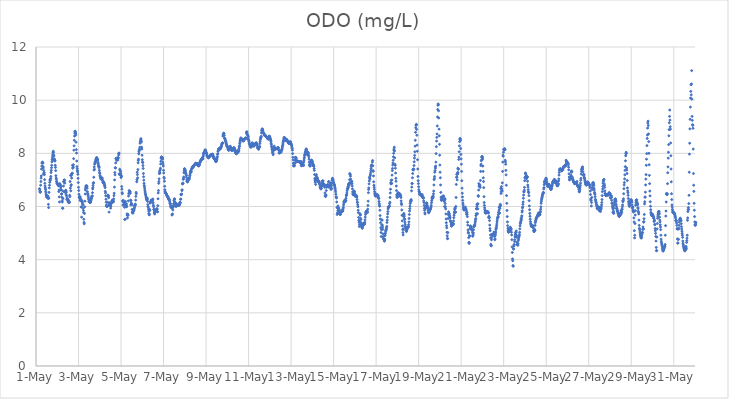
| Category | ODO (mg/L) |
|---|---|
| 44682.166666666664 | 6.67 |
| 44682.177083333336 | 6.63 |
| 44682.1875 | 6.56 |
| 44682.197916666664 | 6.53 |
| 44682.208333333336 | 6.56 |
| 44682.21875 | 6.8 |
| 44682.229166666664 | 6.94 |
| 44682.239583333336 | 7.07 |
| 44682.25 | 7.15 |
| 44682.260416666664 | 7.41 |
| 44682.270833333336 | 7.52 |
| 44682.28125 | 7.63 |
| 44682.291666666664 | 7.65 |
| 44682.302083333336 | 7.67 |
| 44682.3125 | 7.65 |
| 44682.322916666664 | 7.63 |
| 44682.333333333336 | 7.5 |
| 44682.34375 | 7.45 |
| 44682.354166666664 | 7.22 |
| 44682.364583333336 | 7.35 |
| 44682.375 | 7.26 |
| 44682.385416666664 | 7.27 |
| 44682.395833333336 | 7.2 |
| 44682.40625 | 7.01 |
| 44682.416666666664 | 6.87 |
| 44682.427083333336 | 6.77 |
| 44682.4375 | 6.7 |
| 44682.447916666664 | 6.65 |
| 44682.458333333336 | 6.57 |
| 44682.46875 | 6.51 |
| 44682.479166666664 | 6.44 |
| 44682.489583333336 | 6.41 |
| 44682.5 | 6.36 |
| 44682.510416666664 | 6.36 |
| 44682.520833333336 | 6.35 |
| 44682.53125 | 6.39 |
| 44682.541666666664 | 6.39 |
| 44682.552083333336 | 6.38 |
| 44682.5625 | 6.39 |
| 44682.572916666664 | 6.3 |
| 44682.583333333336 | 6.08 |
| 44682.59375 | 5.96 |
| 44682.604166666664 | 6.31 |
| 44682.614583333336 | 6.53 |
| 44682.625 | 6.7 |
| 44682.635416666664 | 6.8 |
| 44682.645833333336 | 6.91 |
| 44682.65625 | 7 |
| 44682.666666666664 | 6.97 |
| 44682.677083333336 | 7.03 |
| 44682.6875 | 7.06 |
| 44682.697916666664 | 7.13 |
| 44682.708333333336 | 7.28 |
| 44682.71875 | 7.36 |
| 44682.729166666664 | 7.46 |
| 44682.739583333336 | 7.55 |
| 44682.75 | 7.68 |
| 44682.760416666664 | 7.76 |
| 44682.770833333336 | 7.83 |
| 44682.78125 | 7.9 |
| 44682.791666666664 | 7.97 |
| 44682.802083333336 | 8.04 |
| 44682.8125 | 8.08 |
| 44682.822916666664 | 8.03 |
| 44682.833333333336 | 7.93 |
| 44682.84375 | 7.9 |
| 44682.854166666664 | 7.75 |
| 44682.864583333336 | 7.79 |
| 44682.875 | 7.75 |
| 44682.885416666664 | 7.71 |
| 44682.895833333336 | 7.72 |
| 44682.90625 | 7.55 |
| 44682.916666666664 | 7.47 |
| 44682.927083333336 | 7.35 |
| 44682.9375 | 7.16 |
| 44682.947916666664 | 7.07 |
| 44682.958333333336 | 7.03 |
| 44682.96875 | 6.95 |
| 44682.979166666664 | 6.92 |
| 44682.989583333336 | 6.86 |
| 44683.0 | 6.86 |
| 44683.010416666664 | 6.86 |
| 44683.020833333336 | 6.84 |
| 44683.03125 | 6.85 |
| 44683.041666666664 | 6.8 |
| 44683.052083333336 | 6.83 |
| 44683.0625 | 6.78 |
| 44683.072916666664 | 6.56 |
| 44683.083333333336 | 6.62 |
| 44683.09375 | 6.36 |
| 44683.104166666664 | 6.17 |
| 44683.114583333336 | 6.86 |
| 44683.125 | 6.82 |
| 44683.135416666664 | 6.78 |
| 44683.145833333336 | 6.81 |
| 44683.15625 | 6.76 |
| 44683.166666666664 | 6.7 |
| 44683.177083333336 | 6.62 |
| 44683.1875 | 6.63 |
| 44683.197916666664 | 6.47 |
| 44683.208333333336 | 6.47 |
| 44683.21875 | 6.35 |
| 44683.229166666664 | 6.22 |
| 44683.239583333336 | 6.17 |
| 44683.25 | 5.94 |
| 44683.260416666664 | 5.93 |
| 44683.270833333336 | 6.3 |
| 44683.28125 | 6.57 |
| 44683.291666666664 | 6.77 |
| 44683.302083333336 | 6.93 |
| 44683.3125 | 6.93 |
| 44683.322916666664 | 7 |
| 44683.333333333336 | 6.99 |
| 44683.34375 | 6.98 |
| 44683.354166666664 | 6.88 |
| 44683.364583333336 | 6.54 |
| 44683.375 | 6.54 |
| 44683.385416666664 | 6.54 |
| 44683.395833333336 | 6.61 |
| 44683.40625 | 6.6 |
| 44683.416666666664 | 6.45 |
| 44683.427083333336 | 6.54 |
| 44683.4375 | 6.4 |
| 44683.447916666664 | 6.26 |
| 44683.458333333336 | 6.32 |
| 44683.46875 | 6.28 |
| 44683.479166666664 | 6.28 |
| 44683.489583333336 | 6.26 |
| 44683.5 | 6.25 |
| 44683.510416666664 | 6.17 |
| 44683.520833333336 | 6.24 |
| 44683.53125 | 6.21 |
| 44683.541666666664 | 6.18 |
| 44683.552083333336 | 6.14 |
| 44683.5625 | 6.15 |
| 44683.572916666664 | 6.17 |
| 44683.583333333336 | 6.42 |
| 44683.59375 | 6.37 |
| 44683.604166666664 | 6.94 |
| 44683.614583333336 | 6.69 |
| 44683.625 | 7.17 |
| 44683.635416666664 | 6.59 |
| 44683.645833333336 | 6.78 |
| 44683.65625 | 6.82 |
| 44683.666666666664 | 7.17 |
| 44683.677083333336 | 7.07 |
| 44683.6875 | 7.24 |
| 44683.697916666664 | 7.24 |
| 44683.708333333336 | 7.25 |
| 44683.71875 | 7.55 |
| 44683.729166666664 | 7.44 |
| 44683.739583333336 | 7.47 |
| 44683.75 | 7.48 |
| 44683.760416666664 | 7.57 |
| 44683.770833333336 | 7.8 |
| 44683.78125 | 8.12 |
| 44683.791666666664 | 8.28 |
| 44683.802083333336 | 8.49 |
| 44683.8125 | 8.65 |
| 44683.822916666664 | 8.76 |
| 44683.833333333336 | 8.83 |
| 44683.84375 | 8.83 |
| 44683.854166666664 | 8.76 |
| 44683.864583333336 | 8.77 |
| 44683.875 | 8.69 |
| 44683.885416666664 | 8.42 |
| 44683.895833333336 | 8.14 |
| 44683.90625 | 8.01 |
| 44683.916666666664 | 7.71 |
| 44683.927083333336 | 7.5 |
| 44683.9375 | 7.42 |
| 44683.947916666664 | 7.35 |
| 44683.958333333336 | 7.3 |
| 44683.96875 | 7.21 |
| 44683.979166666664 | 7.06 |
| 44683.989583333336 | 6.9 |
| 44684.0 | 6.72 |
| 44684.010416666664 | 6.6 |
| 44684.020833333336 | 6.46 |
| 44684.03125 | 6.35 |
| 44684.041666666664 | 6.38 |
| 44684.052083333336 | 6.31 |
| 44684.0625 | 6.33 |
| 44684.072916666664 | 6.23 |
| 44684.083333333336 | 6.36 |
| 44684.09375 | 6.29 |
| 44684.104166666664 | 6.22 |
| 44684.114583333336 | 6.26 |
| 44684.125 | 5.98 |
| 44684.135416666664 | 5.99 |
| 44684.145833333336 | 5.6 |
| 44684.15625 | 6.18 |
| 44684.166666666664 | 6.21 |
| 44684.177083333336 | 6.19 |
| 44684.1875 | 6.12 |
| 44684.197916666664 | 6.09 |
| 44684.208333333336 | 6.07 |
| 44684.21875 | 5.93 |
| 44684.229166666664 | 5.85 |
| 44684.239583333336 | 5.77 |
| 44684.25 | 5.52 |
| 44684.260416666664 | 5.4 |
| 44684.270833333336 | 5.35 |
| 44684.28125 | 5.74 |
| 44684.291666666664 | 5.99 |
| 44684.302083333336 | 6.2 |
| 44684.3125 | 6.47 |
| 44684.322916666664 | 6.62 |
| 44684.333333333336 | 6.69 |
| 44684.34375 | 6.77 |
| 44684.354166666664 | 6.7 |
| 44684.364583333336 | 6.74 |
| 44684.375 | 6.78 |
| 44684.385416666664 | 6.78 |
| 44684.395833333336 | 6.75 |
| 44684.40625 | 6.69 |
| 44684.416666666664 | 6.56 |
| 44684.427083333336 | 6.49 |
| 44684.4375 | 6.48 |
| 44684.447916666664 | 6.43 |
| 44684.458333333336 | 6.39 |
| 44684.46875 | 6.32 |
| 44684.479166666664 | 6.26 |
| 44684.489583333336 | 6.2 |
| 44684.5 | 6.18 |
| 44684.510416666664 | 6.18 |
| 44684.520833333336 | 6.18 |
| 44684.53125 | 6.16 |
| 44684.541666666664 | 6.16 |
| 44684.552083333336 | 6.17 |
| 44684.5625 | 6.15 |
| 44684.572916666664 | 6.2 |
| 44684.583333333336 | 6.23 |
| 44684.59375 | 6.27 |
| 44684.604166666664 | 6.31 |
| 44684.614583333336 | 6.34 |
| 44684.625 | 6.38 |
| 44684.635416666664 | 6.39 |
| 44684.645833333336 | 6.4 |
| 44684.65625 | 6.52 |
| 44684.666666666664 | 6.66 |
| 44684.677083333336 | 6.71 |
| 44684.6875 | 6.79 |
| 44684.697916666664 | 6.87 |
| 44684.708333333336 | 6.9 |
| 44684.71875 | 7.1 |
| 44684.729166666664 | 7.37 |
| 44684.739583333336 | 7.49 |
| 44684.75 | 7.4 |
| 44684.760416666664 | 7.59 |
| 44684.770833333336 | 7.64 |
| 44684.78125 | 7.63 |
| 44684.791666666664 | 7.69 |
| 44684.802083333336 | 7.69 |
| 44684.8125 | 7.76 |
| 44684.822916666664 | 7.73 |
| 44684.833333333336 | 7.8 |
| 44684.84375 | 7.83 |
| 44684.854166666664 | 7.84 |
| 44684.864583333336 | 7.82 |
| 44684.875 | 7.81 |
| 44684.885416666664 | 7.77 |
| 44684.895833333336 | 7.75 |
| 44684.90625 | 7.75 |
| 44684.916666666664 | 7.66 |
| 44684.927083333336 | 7.61 |
| 44684.9375 | 7.55 |
| 44684.947916666664 | 7.51 |
| 44684.958333333336 | 7.5 |
| 44684.96875 | 7.46 |
| 44684.979166666664 | 7.36 |
| 44684.989583333336 | 7.28 |
| 44685.0 | 7.24 |
| 44685.010416666664 | 7.16 |
| 44685.020833333336 | 7.14 |
| 44685.03125 | 7.1 |
| 44685.041666666664 | 7.07 |
| 44685.052083333336 | 7.05 |
| 44685.0625 | 7.03 |
| 44685.072916666664 | 7.07 |
| 44685.083333333336 | 7.08 |
| 44685.09375 | 7.05 |
| 44685.104166666664 | 7.05 |
| 44685.114583333336 | 7.07 |
| 44685.125 | 6.99 |
| 44685.135416666664 | 6.97 |
| 44685.145833333336 | 6.91 |
| 44685.15625 | 6.92 |
| 44685.166666666664 | 6.88 |
| 44685.177083333336 | 6.92 |
| 44685.1875 | 6.9 |
| 44685.197916666664 | 6.89 |
| 44685.208333333336 | 6.86 |
| 44685.21875 | 6.82 |
| 44685.229166666664 | 6.78 |
| 44685.239583333336 | 6.77 |
| 44685.25 | 6.71 |
| 44685.260416666664 | 6.57 |
| 44685.270833333336 | 6.51 |
| 44685.28125 | 6.4 |
| 44685.291666666664 | 6.27 |
| 44685.302083333336 | 6.16 |
| 44685.3125 | 6.05 |
| 44685.322916666664 | 6.02 |
| 44685.333333333336 | 6 |
| 44685.34375 | 6.01 |
| 44685.354166666664 | 6.01 |
| 44685.364583333336 | 6.16 |
| 44685.375 | 6.39 |
| 44685.385416666664 | 6.43 |
| 44685.395833333336 | 6.41 |
| 44685.40625 | 6.39 |
| 44685.416666666664 | 6.33 |
| 44685.427083333336 | 6.04 |
| 44685.4375 | 5.79 |
| 44685.447916666664 | 6.14 |
| 44685.458333333336 | 6.12 |
| 44685.46875 | 6.06 |
| 44685.479166666664 | 6.09 |
| 44685.489583333336 | 6.04 |
| 44685.5 | 6.03 |
| 44685.510416666664 | 5.94 |
| 44685.520833333336 | 6.02 |
| 44685.53125 | 6.13 |
| 44685.541666666664 | 6.13 |
| 44685.552083333336 | 6.12 |
| 44685.5625 | 6.18 |
| 44685.572916666664 | 6.21 |
| 44685.583333333336 | 6.24 |
| 44685.59375 | 6.18 |
| 44685.604166666664 | 6.17 |
| 44685.614583333336 | 6.22 |
| 44685.625 | 6.22 |
| 44685.635416666664 | 6.19 |
| 44685.645833333336 | 6.18 |
| 44685.65625 | 6.29 |
| 44685.666666666664 | 6.41 |
| 44685.677083333336 | 6.5 |
| 44685.6875 | 6.73 |
| 44685.697916666664 | 7 |
| 44685.708333333336 | 7.28 |
| 44685.71875 | 7.19 |
| 44685.729166666664 | 7.46 |
| 44685.739583333336 | 7.45 |
| 44685.75 | 7.64 |
| 44685.760416666664 | 7.8 |
| 44685.770833333336 | 7.79 |
| 44685.78125 | 7.82 |
| 44685.791666666664 | 7.74 |
| 44685.802083333336 | 7.8 |
| 44685.8125 | 7.8 |
| 44685.822916666664 | 7.75 |
| 44685.833333333336 | 7.77 |
| 44685.84375 | 7.82 |
| 44685.854166666664 | 7.75 |
| 44685.864583333336 | 7.84 |
| 44685.875 | 7.83 |
| 44685.885416666664 | 7.94 |
| 44685.895833333336 | 8 |
| 44685.90625 | 8.01 |
| 44685.916666666664 | 7.23 |
| 44685.927083333336 | 7.2 |
| 44685.9375 | 7.4 |
| 44685.947916666664 | 7.21 |
| 44685.958333333336 | 7.36 |
| 44685.96875 | 7.23 |
| 44685.979166666664 | 7.31 |
| 44685.989583333336 | 7.23 |
| 44686.0 | 7.09 |
| 44686.010416666664 | 7.15 |
| 44686.020833333336 | 7.14 |
| 44686.03125 | 6.75 |
| 44686.041666666664 | 6.65 |
| 44686.052083333336 | 6.52 |
| 44686.0625 | 6.48 |
| 44686.072916666664 | 6.21 |
| 44686.083333333336 | 6.21 |
| 44686.09375 | 6.05 |
| 44686.104166666664 | 6.06 |
| 44686.114583333336 | 6.23 |
| 44686.125 | 6.15 |
| 44686.135416666664 | 6.14 |
| 44686.145833333336 | 6.07 |
| 44686.15625 | 6.08 |
| 44686.166666666664 | 5.97 |
| 44686.177083333336 | 5.51 |
| 44686.1875 | 5.52 |
| 44686.197916666664 | 6.12 |
| 44686.208333333336 | 6.19 |
| 44686.21875 | 6.06 |
| 44686.229166666664 | 6.09 |
| 44686.239583333336 | 6.09 |
| 44686.25 | 6.1 |
| 44686.260416666664 | 5.99 |
| 44686.270833333336 | 6.01 |
| 44686.28125 | 5.72 |
| 44686.291666666664 | 5.67 |
| 44686.302083333336 | 5.57 |
| 44686.3125 | 5.68 |
| 44686.322916666664 | 5.71 |
| 44686.333333333336 | 5.67 |
| 44686.34375 | 6.21 |
| 44686.354166666664 | 6.39 |
| 44686.364583333336 | 6.48 |
| 44686.375 | 6.51 |
| 44686.385416666664 | 6.6 |
| 44686.395833333336 | 6.57 |
| 44686.40625 | 6.56 |
| 44686.416666666664 | 6.54 |
| 44686.427083333336 | 6.56 |
| 44686.4375 | 6.5 |
| 44686.447916666664 | 6.24 |
| 44686.458333333336 | 6.06 |
| 44686.46875 | 6.22 |
| 44686.479166666664 | 6.13 |
| 44686.489583333336 | 6.08 |
| 44686.5 | 6.1 |
| 44686.510416666664 | 6.06 |
| 44686.520833333336 | 5.89 |
| 44686.53125 | 5.77 |
| 44686.541666666664 | 5.79 |
| 44686.552083333336 | 5.76 |
| 44686.5625 | 5.75 |
| 44686.572916666664 | 5.81 |
| 44686.583333333336 | 5.84 |
| 44686.59375 | 5.86 |
| 44686.604166666664 | 5.86 |
| 44686.614583333336 | 5.9 |
| 44686.625 | 5.94 |
| 44686.635416666664 | 5.98 |
| 44686.645833333336 | 6.04 |
| 44686.65625 | 6.05 |
| 44686.666666666664 | 6.09 |
| 44686.677083333336 | 6.07 |
| 44686.6875 | 6.24 |
| 44686.697916666664 | 6.38 |
| 44686.708333333336 | 6.53 |
| 44686.71875 | 6.48 |
| 44686.739583333336 | 6.93 |
| 44686.75 | 7.01 |
| 44686.760416666664 | 7.29 |
| 44686.770833333336 | 7.2 |
| 44686.78125 | 7.08 |
| 44686.791666666664 | 7.39 |
| 44686.802083333336 | 7.64 |
| 44686.8125 | 7.73 |
| 44686.822916666664 | 7.78 |
| 44686.833333333336 | 7.98 |
| 44686.84375 | 8.06 |
| 44686.854166666664 | 8.11 |
| 44686.864583333336 | 8.15 |
| 44686.875 | 8.15 |
| 44686.885416666664 | 8.23 |
| 44686.895833333336 | 8.38 |
| 44686.90625 | 8.44 |
| 44686.916666666664 | 8.46 |
| 44686.927083333336 | 8.53 |
| 44686.9375 | 8.55 |
| 44686.947916666664 | 8.47 |
| 44686.958333333336 | 8.43 |
| 44686.96875 | 8.23 |
| 44686.979166666664 | 8.16 |
| 44686.989583333336 | 7.93 |
| 44687.0 | 7.76 |
| 44687.010416666664 | 7.67 |
| 44687.020833333336 | 7.65 |
| 44687.03125 | 7.54 |
| 44687.041666666664 | 7.43 |
| 44687.052083333336 | 7.24 |
| 44687.0625 | 7.12 |
| 44687.072916666664 | 6.99 |
| 44687.083333333336 | 6.87 |
| 44687.09375 | 6.79 |
| 44687.104166666664 | 6.73 |
| 44687.114583333336 | 6.66 |
| 44687.125 | 6.59 |
| 44687.135416666664 | 6.54 |
| 44687.145833333336 | 6.48 |
| 44687.15625 | 6.44 |
| 44687.166666666664 | 6.4 |
| 44687.177083333336 | 6.35 |
| 44687.1875 | 6.32 |
| 44687.197916666664 | 6.27 |
| 44687.208333333336 | 6.24 |
| 44687.21875 | 6.31 |
| 44687.229166666664 | 6.32 |
| 44687.239583333336 | 6.27 |
| 44687.25 | 6.19 |
| 44687.260416666664 | 6.07 |
| 44687.270833333336 | 5.99 |
| 44687.28125 | 5.98 |
| 44687.291666666664 | 5.9 |
| 44687.302083333336 | 5.83 |
| 44687.3125 | 5.74 |
| 44687.322916666664 | 5.7 |
| 44687.333333333336 | 5.69 |
| 44687.34375 | 5.89 |
| 44687.354166666664 | 5.85 |
| 44687.364583333336 | 6.13 |
| 44687.375 | 6.14 |
| 44687.385416666664 | 6.16 |
| 44687.395833333336 | 6.17 |
| 44687.40625 | 6.2 |
| 44687.416666666664 | 6.23 |
| 44687.427083333336 | 6.24 |
| 44687.4375 | 6.23 |
| 44687.447916666664 | 6.19 |
| 44687.458333333336 | 6.17 |
| 44687.46875 | 6.22 |
| 44687.479166666664 | 6.25 |
| 44687.489583333336 | 6.24 |
| 44687.5 | 6.28 |
| 44687.510416666664 | 6.14 |
| 44687.520833333336 | 6.05 |
| 44687.53125 | 5.99 |
| 44687.541666666664 | 5.89 |
| 44687.552083333336 | 5.89 |
| 44687.5625 | 5.79 |
| 44687.572916666664 | 5.75 |
| 44687.583333333336 | 5.72 |
| 44687.59375 | 5.77 |
| 44687.604166666664 | 5.82 |
| 44687.614583333336 | 5.84 |
| 44687.625 | 5.87 |
| 44687.635416666664 | 5.85 |
| 44687.645833333336 | 5.86 |
| 44687.65625 | 5.87 |
| 44687.666666666664 | 5.88 |
| 44687.677083333336 | 5.88 |
| 44687.6875 | 5.92 |
| 44687.697916666664 | 5.9 |
| 44687.708333333336 | 5.81 |
| 44687.71875 | 5.8 |
| 44687.729166666664 | 6.03 |
| 44687.739583333336 | 6.29 |
| 44687.75 | 6.51 |
| 44687.760416666664 | 6.6 |
| 44687.770833333336 | 6.87 |
| 44687.78125 | 6.94 |
| 44687.791666666664 | 7.04 |
| 44687.802083333336 | 7.24 |
| 44687.8125 | 7.33 |
| 44687.822916666664 | 7.26 |
| 44687.833333333336 | 7.26 |
| 44687.84375 | 7.38 |
| 44687.854166666664 | 7.44 |
| 44687.864583333336 | 7.6 |
| 44687.875 | 7.7 |
| 44687.885416666664 | 7.81 |
| 44687.895833333336 | 7.84 |
| 44687.90625 | 7.87 |
| 44687.916666666664 | 7.85 |
| 44687.927083333336 | 7.85 |
| 44687.9375 | 7.84 |
| 44687.947916666664 | 7.83 |
| 44687.958333333336 | 7.78 |
| 44687.96875 | 7.67 |
| 44687.979166666664 | 7.59 |
| 44687.989583333336 | 7.52 |
| 44688.0 | 7.36 |
| 44688.010416666664 | 7.26 |
| 44688.020833333336 | 7.1 |
| 44688.03125 | 7.06 |
| 44688.041666666664 | 6.95 |
| 44688.052083333336 | 6.76 |
| 44688.0625 | 6.63 |
| 44688.072916666664 | 6.57 |
| 44688.083333333336 | 6.53 |
| 44688.09375 | 6.51 |
| 44688.104166666664 | 6.5 |
| 44688.114583333336 | 6.49 |
| 44688.125 | 6.48 |
| 44688.135416666664 | 6.46 |
| 44688.145833333336 | 6.43 |
| 44688.15625 | 6.41 |
| 44688.166666666664 | 6.4 |
| 44688.177083333336 | 6.39 |
| 44688.1875 | 6.37 |
| 44688.197916666664 | 6.36 |
| 44688.208333333336 | 6.36 |
| 44688.21875 | 6.32 |
| 44688.229166666664 | 6.31 |
| 44688.239583333336 | 6.28 |
| 44688.25 | 6.25 |
| 44688.260416666664 | 6.26 |
| 44688.270833333336 | 6.27 |
| 44688.28125 | 6.23 |
| 44688.291666666664 | 6.18 |
| 44688.302083333336 | 6.12 |
| 44688.3125 | 6.1 |
| 44688.322916666664 | 6.11 |
| 44688.333333333336 | 6.02 |
| 44688.34375 | 6.01 |
| 44688.354166666664 | 5.97 |
| 44688.364583333336 | 5.97 |
| 44688.375 | 6.01 |
| 44688.385416666664 | 5.94 |
| 44688.395833333336 | 5.68 |
| 44688.40625 | 5.69 |
| 44688.416666666664 | 5.72 |
| 44688.427083333336 | 5.96 |
| 44688.4375 | 5.87 |
| 44688.447916666664 | 5.98 |
| 44688.458333333336 | 6 |
| 44688.46875 | 6.1 |
| 44688.479166666664 | 6.02 |
| 44688.489583333336 | 6.22 |
| 44688.5 | 6.28 |
| 44688.510416666664 | 6.28 |
| 44688.520833333336 | 6.28 |
| 44688.53125 | 6.17 |
| 44688.541666666664 | 6.14 |
| 44688.552083333336 | 6.15 |
| 44688.5625 | 6.08 |
| 44688.572916666664 | 6.1 |
| 44688.583333333336 | 6.02 |
| 44688.59375 | 6 |
| 44688.604166666664 | 6.06 |
| 44688.614583333336 | 6.08 |
| 44688.625 | 6.07 |
| 44688.635416666664 | 6.08 |
| 44688.645833333336 | 6.08 |
| 44688.65625 | 6.06 |
| 44688.666666666664 | 6.05 |
| 44688.677083333336 | 6.03 |
| 44688.6875 | 6.04 |
| 44688.697916666664 | 6.04 |
| 44688.708333333336 | 6.06 |
| 44688.71875 | 6.05 |
| 44688.729166666664 | 6.05 |
| 44688.739583333336 | 6.06 |
| 44688.75 | 6.07 |
| 44688.760416666664 | 6.13 |
| 44688.770833333336 | 6.16 |
| 44688.78125 | 6.14 |
| 44688.791666666664 | 6.14 |
| 44688.802083333336 | 6.27 |
| 44688.8125 | 6.28 |
| 44688.822916666664 | 6.45 |
| 44688.833333333336 | 6.45 |
| 44688.84375 | 6.45 |
| 44688.854166666664 | 6.47 |
| 44688.864583333336 | 6.6 |
| 44688.875 | 6.63 |
| 44688.885416666664 | 6.85 |
| 44688.895833333336 | 6.87 |
| 44688.90625 | 6.86 |
| 44688.916666666664 | 6.88 |
| 44688.927083333336 | 7.02 |
| 44688.9375 | 7.06 |
| 44688.947916666664 | 7.11 |
| 44688.958333333336 | 7.27 |
| 44688.96875 | 7.34 |
| 44688.979166666664 | 7.42 |
| 44688.989583333336 | 7.41 |
| 44689.0 | 7.41 |
| 44689.010416666664 | 7.37 |
| 44689.020833333336 | 7.37 |
| 44689.03125 | 7.32 |
| 44689.041666666664 | 7.26 |
| 44689.052083333336 | 7.23 |
| 44689.0625 | 7.2 |
| 44689.072916666664 | 7.16 |
| 44689.083333333336 | 7.09 |
| 44689.09375 | 7 |
| 44689.104166666664 | 6.95 |
| 44689.114583333336 | 6.93 |
| 44689.125 | 6.93 |
| 44689.135416666664 | 6.94 |
| 44689.145833333336 | 6.97 |
| 44689.15625 | 7.01 |
| 44689.166666666664 | 7.04 |
| 44689.177083333336 | 7.04 |
| 44689.1875 | 7.03 |
| 44689.197916666664 | 7.02 |
| 44689.208333333336 | 7.06 |
| 44689.21875 | 7.08 |
| 44689.229166666664 | 7.15 |
| 44689.239583333336 | 7.17 |
| 44689.25 | 7.23 |
| 44689.260416666664 | 7.29 |
| 44689.270833333336 | 7.33 |
| 44689.28125 | 7.33 |
| 44689.291666666664 | 7.29 |
| 44689.302083333336 | 7.32 |
| 44689.3125 | 7.39 |
| 44689.322916666664 | 7.41 |
| 44689.333333333336 | 7.43 |
| 44689.34375 | 7.45 |
| 44689.354166666664 | 7.47 |
| 44689.364583333336 | 7.47 |
| 44689.375 | 7.49 |
| 44689.385416666664 | 7.52 |
| 44689.395833333336 | 7.48 |
| 44689.40625 | 7.51 |
| 44689.416666666664 | 7.52 |
| 44689.427083333336 | 7.53 |
| 44689.4375 | 7.54 |
| 44689.447916666664 | 7.55 |
| 44689.458333333336 | 7.56 |
| 44689.46875 | 7.57 |
| 44689.479166666664 | 7.6 |
| 44689.489583333336 | 7.59 |
| 44689.5 | 7.61 |
| 44689.510416666664 | 7.63 |
| 44689.520833333336 | 7.61 |
| 44689.53125 | 7.62 |
| 44689.541666666664 | 7.62 |
| 44689.552083333336 | 7.61 |
| 44689.5625 | 7.6 |
| 44689.572916666664 | 7.6 |
| 44689.583333333336 | 7.61 |
| 44689.59375 | 7.61 |
| 44689.604166666664 | 7.56 |
| 44689.614583333336 | 7.55 |
| 44689.625 | 7.56 |
| 44689.635416666664 | 7.54 |
| 44689.645833333336 | 7.54 |
| 44689.65625 | 7.52 |
| 44689.666666666664 | 7.54 |
| 44689.677083333336 | 7.58 |
| 44689.6875 | 7.57 |
| 44689.697916666664 | 7.63 |
| 44689.708333333336 | 7.66 |
| 44689.71875 | 7.68 |
| 44689.729166666664 | 7.68 |
| 44689.739583333336 | 7.71 |
| 44689.75 | 7.74 |
| 44689.760416666664 | 7.74 |
| 44689.770833333336 | 7.76 |
| 44689.78125 | 7.77 |
| 44689.791666666664 | 7.78 |
| 44689.802083333336 | 7.78 |
| 44689.8125 | 7.79 |
| 44689.822916666664 | 7.78 |
| 44689.833333333336 | 7.84 |
| 44689.84375 | 7.81 |
| 44689.854166666664 | 7.79 |
| 44689.864583333336 | 7.88 |
| 44689.875 | 7.94 |
| 44689.885416666664 | 8 |
| 44689.895833333336 | 8.01 |
| 44689.90625 | 8.03 |
| 44689.916666666664 | 8.02 |
| 44689.927083333336 | 8.04 |
| 44689.9375 | 8.08 |
| 44689.947916666664 | 8.13 |
| 44689.958333333336 | 8.12 |
| 44689.96875 | 8.11 |
| 44689.979166666664 | 8.11 |
| 44689.989583333336 | 8.07 |
| 44690.0 | 8.03 |
| 44690.010416666664 | 8.01 |
| 44690.020833333336 | 8.01 |
| 44690.03125 | 7.97 |
| 44690.041666666664 | 7.92 |
| 44690.052083333336 | 7.89 |
| 44690.0625 | 7.9 |
| 44690.072916666664 | 7.88 |
| 44690.083333333336 | 7.88 |
| 44690.09375 | 7.84 |
| 44690.104166666664 | 7.84 |
| 44690.114583333336 | 7.83 |
| 44690.125 | 7.84 |
| 44690.135416666664 | 7.84 |
| 44690.145833333336 | 7.87 |
| 44690.15625 | 7.88 |
| 44690.166666666664 | 7.89 |
| 44690.177083333336 | 7.9 |
| 44690.1875 | 7.91 |
| 44690.197916666664 | 7.92 |
| 44690.208333333336 | 7.93 |
| 44690.21875 | 7.94 |
| 44690.229166666664 | 7.94 |
| 44690.239583333336 | 7.93 |
| 44690.25 | 7.94 |
| 44690.260416666664 | 7.94 |
| 44690.270833333336 | 7.95 |
| 44690.28125 | 7.96 |
| 44690.291666666664 | 7.96 |
| 44690.302083333336 | 7.96 |
| 44690.3125 | 7.97 |
| 44690.322916666664 | 7.93 |
| 44690.333333333336 | 7.86 |
| 44690.34375 | 7.88 |
| 44690.354166666664 | 7.88 |
| 44690.364583333336 | 7.82 |
| 44690.375 | 7.81 |
| 44690.385416666664 | 7.83 |
| 44690.395833333336 | 7.79 |
| 44690.40625 | 7.77 |
| 44690.416666666664 | 7.77 |
| 44690.427083333336 | 7.77 |
| 44690.4375 | 7.74 |
| 44690.447916666664 | 7.71 |
| 44690.458333333336 | 7.69 |
| 44690.46875 | 7.69 |
| 44690.479166666664 | 7.7 |
| 44690.489583333336 | 7.72 |
| 44690.5 | 7.77 |
| 44690.510416666664 | 7.79 |
| 44690.520833333336 | 7.84 |
| 44690.53125 | 7.88 |
| 44690.541666666664 | 7.96 |
| 44690.552083333336 | 7.98 |
| 44690.5625 | 8.07 |
| 44690.572916666664 | 8.12 |
| 44690.583333333336 | 8.16 |
| 44690.59375 | 8.13 |
| 44690.604166666664 | 8.14 |
| 44690.614583333336 | 8.17 |
| 44690.625 | 8.19 |
| 44690.635416666664 | 8.19 |
| 44690.645833333336 | 8.19 |
| 44690.65625 | 8.16 |
| 44690.666666666664 | 8.17 |
| 44690.677083333336 | 8.19 |
| 44690.6875 | 8.19 |
| 44690.697916666664 | 8.21 |
| 44690.708333333336 | 8.25 |
| 44690.71875 | 8.26 |
| 44690.729166666664 | 8.3 |
| 44690.739583333336 | 8.33 |
| 44690.75 | 8.36 |
| 44690.760416666664 | 8.37 |
| 44690.770833333336 | 8.39 |
| 44690.78125 | 8.39 |
| 44690.791666666664 | 8.65 |
| 44690.802083333336 | 8.7 |
| 44690.8125 | 8.69 |
| 44690.822916666664 | 8.75 |
| 44690.833333333336 | 8.76 |
| 44690.84375 | 8.74 |
| 44690.854166666664 | 8.67 |
| 44690.864583333336 | 8.57 |
| 44690.875 | 8.57 |
| 44690.885416666664 | 8.56 |
| 44690.895833333336 | 8.53 |
| 44690.90625 | 8.49 |
| 44690.916666666664 | 8.47 |
| 44690.927083333336 | 8.44 |
| 44690.9375 | 8.4 |
| 44690.947916666664 | 8.38 |
| 44690.958333333336 | 8.33 |
| 44690.96875 | 8.31 |
| 44690.979166666664 | 8.28 |
| 44690.989583333336 | 8.27 |
| 44691.0 | 8.26 |
| 44691.010416666664 | 8.24 |
| 44691.020833333336 | 8.21 |
| 44691.03125 | 8.17 |
| 44691.041666666664 | 8.14 |
| 44691.052083333336 | 8.13 |
| 44691.0625 | 8.11 |
| 44691.072916666664 | 8.15 |
| 44691.083333333336 | 8.14 |
| 44691.09375 | 8.14 |
| 44691.104166666664 | 8.16 |
| 44691.114583333336 | 8.16 |
| 44691.125 | 8.22 |
| 44691.135416666664 | 8.27 |
| 44691.145833333336 | 8.24 |
| 44691.15625 | 8.22 |
| 44691.166666666664 | 8.17 |
| 44691.177083333336 | 8.18 |
| 44691.1875 | 8.16 |
| 44691.197916666664 | 8.12 |
| 44691.208333333336 | 8.11 |
| 44691.21875 | 8.1 |
| 44691.229166666664 | 8.13 |
| 44691.239583333336 | 8.18 |
| 44691.25 | 8.17 |
| 44691.260416666664 | 8.16 |
| 44691.270833333336 | 8.18 |
| 44691.28125 | 8.19 |
| 44691.291666666664 | 8.2 |
| 44691.302083333336 | 8.21 |
| 44691.3125 | 8.18 |
| 44691.322916666664 | 8.2 |
| 44691.333333333336 | 8.19 |
| 44691.34375 | 8.09 |
| 44691.354166666664 | 8.14 |
| 44691.364583333336 | 8.12 |
| 44691.375 | 8.06 |
| 44691.385416666664 | 8.08 |
| 44691.395833333336 | 8 |
| 44691.40625 | 8.01 |
| 44691.416666666664 | 8 |
| 44691.427083333336 | 7.98 |
| 44691.4375 | 8.02 |
| 44691.447916666664 | 8.02 |
| 44691.458333333336 | 8.07 |
| 44691.46875 | 8.08 |
| 44691.479166666664 | 8.02 |
| 44691.489583333336 | 8.1 |
| 44691.5 | 8.05 |
| 44691.510416666664 | 8.07 |
| 44691.520833333336 | 8.07 |
| 44691.53125 | 8.07 |
| 44691.541666666664 | 8.12 |
| 44691.552083333336 | 8.18 |
| 44691.5625 | 8.25 |
| 44691.572916666664 | 8.28 |
| 44691.583333333336 | 8.36 |
| 44691.59375 | 8.42 |
| 44691.604166666664 | 8.47 |
| 44691.614583333336 | 8.52 |
| 44691.625 | 8.5 |
| 44691.635416666664 | 8.58 |
| 44691.645833333336 | 8.57 |
| 44691.65625 | 8.56 |
| 44691.666666666664 | 8.53 |
| 44691.677083333336 | 8.53 |
| 44691.6875 | 8.51 |
| 44691.697916666664 | 8.53 |
| 44691.708333333336 | 8.5 |
| 44691.71875 | 8.49 |
| 44691.729166666664 | 8.47 |
| 44691.739583333336 | 8.47 |
| 44691.75 | 8.48 |
| 44691.760416666664 | 8.47 |
| 44691.770833333336 | 8.47 |
| 44691.78125 | 8.5 |
| 44691.791666666664 | 8.52 |
| 44691.802083333336 | 8.53 |
| 44691.8125 | 8.54 |
| 44691.822916666664 | 8.54 |
| 44691.833333333336 | 8.56 |
| 44691.84375 | 8.56 |
| 44691.854166666664 | 8.57 |
| 44691.864583333336 | 8.57 |
| 44691.875 | 8.58 |
| 44691.885416666664 | 8.56 |
| 44691.895833333336 | 8.76 |
| 44691.90625 | 8.79 |
| 44691.916666666664 | 8.81 |
| 44691.927083333336 | 8.8 |
| 44691.9375 | 8.72 |
| 44691.947916666664 | 8.71 |
| 44691.958333333336 | 8.69 |
| 44691.96875 | 8.66 |
| 44691.979166666664 | 8.56 |
| 44691.989583333336 | 8.62 |
| 44692.0 | 8.51 |
| 44692.010416666664 | 8.47 |
| 44692.020833333336 | 8.44 |
| 44692.03125 | 8.38 |
| 44692.041666666664 | 8.36 |
| 44692.052083333336 | 8.34 |
| 44692.0625 | 8.31 |
| 44692.072916666664 | 8.28 |
| 44692.083333333336 | 8.26 |
| 44692.09375 | 8.26 |
| 44692.104166666664 | 8.24 |
| 44692.114583333336 | 8.23 |
| 44692.125 | 8.24 |
| 44692.135416666664 | 8.28 |
| 44692.145833333336 | 8.29 |
| 44692.15625 | 8.34 |
| 44692.166666666664 | 8.39 |
| 44692.177083333336 | 8.39 |
| 44692.1875 | 8.36 |
| 44692.197916666664 | 8.32 |
| 44692.208333333336 | 8.32 |
| 44692.21875 | 8.31 |
| 44692.229166666664 | 8.3 |
| 44692.239583333336 | 8.28 |
| 44692.25 | 8.27 |
| 44692.260416666664 | 8.28 |
| 44692.270833333336 | 8.3 |
| 44692.28125 | 8.33 |
| 44692.291666666664 | 8.34 |
| 44692.302083333336 | 8.35 |
| 44692.3125 | 8.36 |
| 44692.322916666664 | 8.36 |
| 44692.333333333336 | 8.37 |
| 44692.34375 | 8.39 |
| 44692.354166666664 | 8.38 |
| 44692.364583333336 | 8.38 |
| 44692.375 | 8.39 |
| 44692.385416666664 | 8.33 |
| 44692.395833333336 | 8.34 |
| 44692.40625 | 8.31 |
| 44692.416666666664 | 8.23 |
| 44692.427083333336 | 8.23 |
| 44692.4375 | 8.19 |
| 44692.447916666664 | 8.19 |
| 44692.458333333336 | 8.19 |
| 44692.46875 | 8.15 |
| 44692.479166666664 | 8.17 |
| 44692.489583333336 | 8.22 |
| 44692.5 | 8.24 |
| 44692.510416666664 | 8.23 |
| 44692.520833333336 | 8.26 |
| 44692.53125 | 8.37 |
| 44692.541666666664 | 8.44 |
| 44692.552083333336 | 8.51 |
| 44692.5625 | 8.55 |
| 44692.572916666664 | 8.61 |
| 44692.583333333336 | 8.59 |
| 44692.59375 | 8.64 |
| 44692.604166666664 | 8.77 |
| 44692.614583333336 | 8.85 |
| 44692.625 | 8.88 |
| 44692.635416666664 | 8.92 |
| 44692.645833333336 | 8.91 |
| 44692.65625 | 8.9 |
| 44692.666666666664 | 8.87 |
| 44692.677083333336 | 8.84 |
| 44692.6875 | 8.76 |
| 44692.697916666664 | 8.77 |
| 44692.708333333336 | 8.77 |
| 44692.71875 | 8.75 |
| 44692.729166666664 | 8.72 |
| 44692.739583333336 | 8.68 |
| 44692.75 | 8.68 |
| 44692.760416666664 | 8.69 |
| 44692.770833333336 | 8.68 |
| 44692.78125 | 8.68 |
| 44692.791666666664 | 8.67 |
| 44692.802083333336 | 8.65 |
| 44692.8125 | 8.64 |
| 44692.822916666664 | 8.63 |
| 44692.833333333336 | 8.63 |
| 44692.84375 | 8.62 |
| 44692.854166666664 | 8.61 |
| 44692.864583333336 | 8.6 |
| 44692.875 | 8.58 |
| 44692.885416666664 | 8.57 |
| 44692.895833333336 | 8.56 |
| 44692.90625 | 8.55 |
| 44692.916666666664 | 8.55 |
| 44692.927083333336 | 8.53 |
| 44692.9375 | 8.62 |
| 44692.947916666664 | 8.62 |
| 44692.958333333336 | 8.63 |
| 44692.96875 | 8.65 |
| 44692.979166666664 | 8.64 |
| 44692.989583333336 | 8.63 |
| 44693.0 | 8.6 |
| 44693.010416666664 | 8.57 |
| 44693.020833333336 | 8.55 |
| 44693.03125 | 8.51 |
| 44693.041666666664 | 8.49 |
| 44693.052083333336 | 8.44 |
| 44693.0625 | 8.37 |
| 44693.072916666664 | 8.33 |
| 44693.083333333336 | 8.26 |
| 44693.09375 | 8.22 |
| 44693.104166666664 | 8.15 |
| 44693.114583333336 | 8.13 |
| 44693.125 | 8.05 |
| 44693.135416666664 | 8.04 |
| 44693.145833333336 | 8 |
| 44693.15625 | 7.95 |
| 44693.166666666664 | 8.1 |
| 44693.177083333336 | 8.17 |
| 44693.1875 | 8.17 |
| 44693.197916666664 | 8.13 |
| 44693.208333333336 | 8.27 |
| 44693.21875 | 8.21 |
| 44693.229166666664 | 8.16 |
| 44693.239583333336 | 8.16 |
| 44693.25 | 8.16 |
| 44693.260416666664 | 8.16 |
| 44693.270833333336 | 8.17 |
| 44693.28125 | 8.17 |
| 44693.291666666664 | 8.18 |
| 44693.302083333336 | 8.18 |
| 44693.3125 | 8.17 |
| 44693.322916666664 | 8.18 |
| 44693.333333333336 | 8.19 |
| 44693.34375 | 8.19 |
| 44693.354166666664 | 8.2 |
| 44693.364583333336 | 8.2 |
| 44693.375 | 8.2 |
| 44693.385416666664 | 8.21 |
| 44693.395833333336 | 8.21 |
| 44693.40625 | 8.21 |
| 44693.416666666664 | 8.14 |
| 44693.427083333336 | 8.1 |
| 44693.4375 | 8.01 |
| 44693.447916666664 | 8.03 |
| 44693.458333333336 | 8.01 |
| 44693.46875 | 8.04 |
| 44693.479166666664 | 8.03 |
| 44693.489583333336 | 8.04 |
| 44693.5 | 8.05 |
| 44693.510416666664 | 8.05 |
| 44693.520833333336 | 8.04 |
| 44693.53125 | 8.06 |
| 44693.541666666664 | 8.1 |
| 44693.552083333336 | 8.12 |
| 44693.5625 | 8.13 |
| 44693.572916666664 | 8.16 |
| 44693.583333333336 | 8.2 |
| 44693.59375 | 8.26 |
| 44693.604166666664 | 8.3 |
| 44693.614583333336 | 8.35 |
| 44693.625 | 8.41 |
| 44693.635416666664 | 8.45 |
| 44693.645833333336 | 8.48 |
| 44693.65625 | 8.54 |
| 44693.666666666664 | 8.58 |
| 44693.677083333336 | 8.6 |
| 44693.6875 | 8.59 |
| 44693.697916666664 | 8.57 |
| 44693.708333333336 | 8.55 |
| 44693.71875 | 8.56 |
| 44693.729166666664 | 8.56 |
| 44693.739583333336 | 8.53 |
| 44693.75 | 8.49 |
| 44693.760416666664 | 8.48 |
| 44693.770833333336 | 8.51 |
| 44693.78125 | 8.51 |
| 44693.791666666664 | 8.52 |
| 44693.802083333336 | 8.51 |
| 44693.8125 | 8.48 |
| 44693.822916666664 | 8.47 |
| 44693.833333333336 | 8.45 |
| 44693.84375 | 8.45 |
| 44693.854166666664 | 8.43 |
| 44693.864583333336 | 8.41 |
| 44693.875 | 8.4 |
| 44693.885416666664 | 8.4 |
| 44693.895833333336 | 8.38 |
| 44693.90625 | 8.37 |
| 44693.916666666664 | 8.38 |
| 44693.927083333336 | 8.37 |
| 44693.9375 | 8.43 |
| 44693.947916666664 | 8.42 |
| 44693.958333333336 | 8.43 |
| 44693.96875 | 8.42 |
| 44693.979166666664 | 8.43 |
| 44693.989583333336 | 8.38 |
| 44694.0 | 8.36 |
| 44694.010416666664 | 8.33 |
| 44694.020833333336 | 8.31 |
| 44694.03125 | 8.28 |
| 44694.041666666664 | 8.23 |
| 44694.052083333336 | 8.18 |
| 44694.0625 | 8.12 |
| 44694.072916666664 | 7.99 |
| 44694.083333333336 | 7.85 |
| 44694.09375 | 7.75 |
| 44694.104166666664 | 7.63 |
| 44694.114583333336 | 7.53 |
| 44694.125 | 7.56 |
| 44694.135416666664 | 7.54 |
| 44694.145833333336 | 7.52 |
| 44694.15625 | 7.55 |
| 44694.166666666664 | 7.63 |
| 44694.177083333336 | 7.63 |
| 44694.1875 | 7.74 |
| 44694.197916666664 | 7.85 |
| 44694.208333333336 | 7.83 |
| 44694.21875 | 7.83 |
| 44694.229166666664 | 7.84 |
| 44694.239583333336 | 7.8 |
| 44694.25 | 7.73 |
| 44694.260416666664 | 7.7 |
| 44694.270833333336 | 7.68 |
| 44694.28125 | 7.7 |
| 44694.291666666664 | 7.7 |
| 44694.302083333336 | 7.7 |
| 44694.3125 | 7.7 |
| 44694.322916666664 | 7.7 |
| 44694.333333333336 | 7.69 |
| 44694.34375 | 7.69 |
| 44694.354166666664 | 7.7 |
| 44694.364583333336 | 7.69 |
| 44694.375 | 7.69 |
| 44694.385416666664 | 7.68 |
| 44694.395833333336 | 7.68 |
| 44694.40625 | 7.68 |
| 44694.416666666664 | 7.66 |
| 44694.427083333336 | 7.64 |
| 44694.4375 | 7.66 |
| 44694.447916666664 | 7.67 |
| 44694.458333333336 | 7.69 |
| 44694.46875 | 7.68 |
| 44694.479166666664 | 7.54 |
| 44694.489583333336 | 7.59 |
| 44694.5 | 7.53 |
| 44694.510416666664 | 7.57 |
| 44694.520833333336 | 7.61 |
| 44694.53125 | 7.59 |
| 44694.541666666664 | 7.61 |
| 44694.552083333336 | 7.61 |
| 44694.5625 | 7.56 |
| 44694.572916666664 | 7.57 |
| 44694.583333333336 | 7.54 |
| 44694.59375 | 7.67 |
| 44694.604166666664 | 7.73 |
| 44694.614583333336 | 7.79 |
| 44694.625 | 7.85 |
| 44694.635416666664 | 7.92 |
| 44694.645833333336 | 7.95 |
| 44694.65625 | 7.97 |
| 44694.666666666664 | 8.03 |
| 44694.677083333336 | 8.06 |
| 44694.6875 | 8.09 |
| 44694.697916666664 | 8.14 |
| 44694.708333333336 | 8.16 |
| 44694.71875 | 8.16 |
| 44694.729166666664 | 8.12 |
| 44694.739583333336 | 8.07 |
| 44694.75 | 7.99 |
| 44694.760416666664 | 7.95 |
| 44694.770833333336 | 8 |
| 44694.78125 | 8.01 |
| 44694.791666666664 | 8.03 |
| 44694.802083333336 | 8.03 |
| 44694.8125 | 8 |
| 44694.822916666664 | 7.93 |
| 44694.833333333336 | 7.87 |
| 44694.84375 | 7.78 |
| 44694.854166666664 | 7.67 |
| 44694.864583333336 | 7.58 |
| 44694.875 | 7.54 |
| 44694.885416666664 | 7.53 |
| 44694.895833333336 | 7.52 |
| 44694.90625 | 7.55 |
| 44694.916666666664 | 7.63 |
| 44694.927083333336 | 7.68 |
| 44694.9375 | 7.71 |
| 44694.947916666664 | 7.72 |
| 44694.958333333336 | 7.74 |
| 44694.96875 | 7.74 |
| 44694.979166666664 | 7.72 |
| 44694.989583333336 | 7.7 |
| 44695.0 | 7.69 |
| 44695.010416666664 | 7.63 |
| 44695.020833333336 | 7.59 |
| 44695.03125 | 7.54 |
| 44695.041666666664 | 7.59 |
| 44695.052083333336 | 7.54 |
| 44695.0625 | 7.52 |
| 44695.072916666664 | 7.52 |
| 44695.083333333336 | 7.43 |
| 44695.09375 | 7.36 |
| 44695.104166666664 | 7.2 |
| 44695.114583333336 | 7.05 |
| 44695.125 | 6.98 |
| 44695.135416666664 | 6.91 |
| 44695.145833333336 | 7 |
| 44695.15625 | 6.83 |
| 44695.166666666664 | 7.07 |
| 44695.177083333336 | 7.16 |
| 44695.1875 | 7.2 |
| 44695.197916666664 | 7.09 |
| 44695.208333333336 | 6.99 |
| 44695.21875 | 7.02 |
| 44695.229166666664 | 7.09 |
| 44695.239583333336 | 7.05 |
| 44695.25 | 6.97 |
| 44695.260416666664 | 6.98 |
| 44695.270833333336 | 6.94 |
| 44695.28125 | 6.93 |
| 44695.291666666664 | 6.92 |
| 44695.302083333336 | 6.93 |
| 44695.3125 | 6.96 |
| 44695.322916666664 | 6.92 |
| 44695.333333333336 | 6.87 |
| 44695.34375 | 6.85 |
| 44695.354166666664 | 6.82 |
| 44695.364583333336 | 6.76 |
| 44695.375 | 6.72 |
| 44695.385416666664 | 6.69 |
| 44695.395833333336 | 6.67 |
| 44695.40625 | 6.66 |
| 44695.416666666664 | 6.68 |
| 44695.427083333336 | 6.74 |
| 44695.4375 | 6.78 |
| 44695.447916666664 | 6.85 |
| 44695.458333333336 | 6.89 |
| 44695.46875 | 6.95 |
| 44695.479166666664 | 6.95 |
| 44695.489583333336 | 6.95 |
| 44695.5 | 6.97 |
| 44695.510416666664 | 6.84 |
| 44695.520833333336 | 6.79 |
| 44695.53125 | 6.86 |
| 44695.541666666664 | 6.79 |
| 44695.552083333336 | 6.82 |
| 44695.5625 | 6.82 |
| 44695.572916666664 | 6.82 |
| 44695.583333333336 | 6.72 |
| 44695.59375 | 6.51 |
| 44695.604166666664 | 6.41 |
| 44695.614583333336 | 6.38 |
| 44695.625 | 6.38 |
| 44695.635416666664 | 6.43 |
| 44695.645833333336 | 6.43 |
| 44695.65625 | 6.6 |
| 44695.666666666664 | 6.74 |
| 44695.677083333336 | 6.73 |
| 44695.6875 | 6.8 |
| 44695.697916666664 | 6.78 |
| 44695.708333333336 | 6.8 |
| 44695.71875 | 6.82 |
| 44695.729166666664 | 6.81 |
| 44695.739583333336 | 6.75 |
| 44695.75 | 6.73 |
| 44695.760416666664 | 6.93 |
| 44695.770833333336 | 6.94 |
| 44695.78125 | 6.78 |
| 44695.791666666664 | 6.75 |
| 44695.802083333336 | 6.78 |
| 44695.8125 | 6.81 |
| 44695.822916666664 | 6.82 |
| 44695.833333333336 | 6.85 |
| 44695.84375 | 6.88 |
| 44695.854166666664 | 6.76 |
| 44695.864583333336 | 6.69 |
| 44695.875 | 6.65 |
| 44695.885416666664 | 6.65 |
| 44695.895833333336 | 6.69 |
| 44695.90625 | 6.79 |
| 44695.916666666664 | 6.89 |
| 44695.927083333336 | 6.99 |
| 44695.9375 | 7.03 |
| 44695.947916666664 | 7.06 |
| 44695.958333333336 | 7.04 |
| 44695.96875 | 7.01 |
| 44695.979166666664 | 6.97 |
| 44695.989583333336 | 6.92 |
| 44696.0 | 6.89 |
| 44696.010416666664 | 6.86 |
| 44696.020833333336 | 6.83 |
| 44696.03125 | 6.81 |
| 44696.041666666664 | 6.81 |
| 44696.052083333336 | 6.77 |
| 44696.0625 | 6.7 |
| 44696.072916666664 | 6.69 |
| 44696.083333333336 | 6.62 |
| 44696.09375 | 6.55 |
| 44696.104166666664 | 6.46 |
| 44696.114583333336 | 6.36 |
| 44696.125 | 6.36 |
| 44696.135416666664 | 6.32 |
| 44696.145833333336 | 6.17 |
| 44696.15625 | 5.96 |
| 44696.166666666664 | 5.7 |
| 44696.177083333336 | 5.75 |
| 44696.1875 | 5.74 |
| 44696.197916666664 | 5.84 |
| 44696.208333333336 | 6.02 |
| 44696.21875 | 5.93 |
| 44696.229166666664 | 5.95 |
| 44696.239583333336 | 5.93 |
| 44696.25 | 5.9 |
| 44696.260416666664 | 5.82 |
| 44696.270833333336 | 5.78 |
| 44696.28125 | 5.73 |
| 44696.291666666664 | 5.72 |
| 44696.302083333336 | 5.71 |
| 44696.3125 | 5.71 |
| 44696.322916666664 | 5.7 |
| 44696.333333333336 | 5.77 |
| 44696.34375 | 5.8 |
| 44696.354166666664 | 5.82 |
| 44696.364583333336 | 5.83 |
| 44696.375 | 5.85 |
| 44696.385416666664 | 5.84 |
| 44696.395833333336 | 5.83 |
| 44696.40625 | 5.81 |
| 44696.416666666664 | 5.82 |
| 44696.427083333336 | 5.83 |
| 44696.4375 | 5.86 |
| 44696.447916666664 | 5.92 |
| 44696.458333333336 | 5.97 |
| 44696.46875 | 6.06 |
| 44696.479166666664 | 6.13 |
| 44696.489583333336 | 6.19 |
| 44696.5 | 6.2 |
| 44696.510416666664 | 6.22 |
| 44696.520833333336 | 6.23 |
| 44696.53125 | 6.22 |
| 44696.541666666664 | 6.21 |
| 44696.552083333336 | 6.18 |
| 44696.5625 | 6.23 |
| 44696.572916666664 | 6.22 |
| 44696.583333333336 | 6.31 |
| 44696.59375 | 6.4 |
| 44696.604166666664 | 6.44 |
| 44696.614583333336 | 6.44 |
| 44696.625 | 6.51 |
| 44696.635416666664 | 6.59 |
| 44696.645833333336 | 6.67 |
| 44696.65625 | 6.67 |
| 44696.666666666664 | 6.67 |
| 44696.677083333336 | 6.75 |
| 44696.6875 | 6.72 |
| 44696.697916666664 | 6.81 |
| 44696.708333333336 | 6.84 |
| 44696.71875 | 6.86 |
| 44696.729166666664 | 6.8 |
| 44696.739583333336 | 6.89 |
| 44696.75 | 7.01 |
| 44696.760416666664 | 7.24 |
| 44696.770833333336 | 7.2 |
| 44696.78125 | 7.19 |
| 44696.791666666664 | 7.14 |
| 44696.802083333336 | 7.03 |
| 44696.8125 | 6.92 |
| 44696.822916666664 | 6.87 |
| 44696.833333333336 | 6.87 |
| 44696.84375 | 6.93 |
| 44696.854166666664 | 6.95 |
| 44696.864583333336 | 6.86 |
| 44696.875 | 6.77 |
| 44696.885416666664 | 6.66 |
| 44696.895833333336 | 6.55 |
| 44696.90625 | 6.49 |
| 44696.916666666664 | 6.45 |
| 44696.927083333336 | 6.44 |
| 44696.9375 | 6.48 |
| 44696.947916666664 | 6.55 |
| 44696.958333333336 | 6.56 |
| 44696.96875 | 6.58 |
| 44696.979166666664 | 6.56 |
| 44696.989583333336 | 6.5 |
| 44697.0 | 6.44 |
| 44697.010416666664 | 6.41 |
| 44697.020833333336 | 6.38 |
| 44697.03125 | 6.41 |
| 44697.041666666664 | 6.4 |
| 44697.052083333336 | 6.42 |
| 44697.0625 | 6.42 |
| 44697.072916666664 | 6.36 |
| 44697.083333333336 | 6.36 |
| 44697.09375 | 6.36 |
| 44697.104166666664 | 6.26 |
| 44697.114583333336 | 6.16 |
| 44697.125 | 6.15 |
| 44697.135416666664 | 6.06 |
| 44697.145833333336 | 5.99 |
| 44697.15625 | 5.86 |
| 44697.166666666664 | 5.77 |
| 44697.177083333336 | 5.59 |
| 44697.1875 | 5.48 |
| 44697.197916666664 | 5.41 |
| 44697.208333333336 | 5.25 |
| 44697.21875 | 5.33 |
| 44697.229166666664 | 5.44 |
| 44697.239583333336 | 5.73 |
| 44697.25 | 5.69 |
| 44697.260416666664 | 5.68 |
| 44697.270833333336 | 5.55 |
| 44697.28125 | 5.51 |
| 44697.291666666664 | 5.39 |
| 44697.302083333336 | 5.31 |
| 44697.3125 | 5.28 |
| 44697.322916666664 | 5.23 |
| 44697.333333333336 | 5.22 |
| 44697.34375 | 5.21 |
| 44697.354166666664 | 5.18 |
| 44697.364583333336 | 5.26 |
| 44697.375 | 5.3 |
| 44697.385416666664 | 5.32 |
| 44697.395833333336 | 5.33 |
| 44697.40625 | 5.37 |
| 44697.416666666664 | 5.36 |
| 44697.427083333336 | 5.34 |
| 44697.4375 | 5.33 |
| 44697.447916666664 | 5.33 |
| 44697.458333333336 | 5.35 |
| 44697.46875 | 5.41 |
| 44697.479166666664 | 5.5 |
| 44697.489583333336 | 5.6 |
| 44697.5 | 5.7 |
| 44697.510416666664 | 5.76 |
| 44697.520833333336 | 5.79 |
| 44697.53125 | 5.82 |
| 44697.541666666664 | 5.81 |
| 44697.552083333336 | 5.81 |
| 44697.5625 | 5.8 |
| 44697.572916666664 | 5.83 |
| 44697.583333333336 | 5.82 |
| 44697.59375 | 5.77 |
| 44697.604166666664 | 5.9 |
| 44697.614583333336 | 6.04 |
| 44697.625 | 6.2 |
| 44697.635416666664 | 6.52 |
| 44697.645833333336 | 6.64 |
| 44697.65625 | 6.7 |
| 44697.666666666664 | 6.85 |
| 44697.677083333336 | 6.96 |
| 44697.6875 | 7.1 |
| 44697.697916666664 | 7.06 |
| 44697.708333333336 | 7.03 |
| 44697.71875 | 7.15 |
| 44697.729166666664 | 7.19 |
| 44697.739583333336 | 7.26 |
| 44697.75 | 7.34 |
| 44697.760416666664 | 7.42 |
| 44697.770833333336 | 7.5 |
| 44697.78125 | 7.56 |
| 44697.791666666664 | 7.54 |
| 44697.802083333336 | 7.53 |
| 44697.8125 | 7.55 |
| 44697.822916666664 | 7.67 |
| 44697.833333333336 | 7.73 |
| 44697.84375 | 7.53 |
| 44697.854166666664 | 7.35 |
| 44697.864583333336 | 7.32 |
| 44697.875 | 7.15 |
| 44697.885416666664 | 6.93 |
| 44697.895833333336 | 6.8 |
| 44697.90625 | 6.73 |
| 44697.916666666664 | 6.65 |
| 44697.927083333336 | 6.56 |
| 44697.9375 | 6.5 |
| 44697.947916666664 | 6.45 |
| 44697.958333333336 | 6.41 |
| 44697.96875 | 6.39 |
| 44697.979166666664 | 6.41 |
| 44697.989583333336 | 6.46 |
| 44698.0 | 6.47 |
| 44698.010416666664 | 6.45 |
| 44698.020833333336 | 6.42 |
| 44698.03125 | 6.39 |
| 44698.041666666664 | 6.4 |
| 44698.052083333336 | 6.41 |
| 44698.0625 | 6.42 |
| 44698.072916666664 | 6.44 |
| 44698.083333333336 | 6.42 |
| 44698.09375 | 6.4 |
| 44698.104166666664 | 6.35 |
| 44698.114583333336 | 6.31 |
| 44698.125 | 6.3 |
| 44698.135416666664 | 6.19 |
| 44698.145833333336 | 6.11 |
| 44698.15625 | 6.05 |
| 44698.166666666664 | 6.01 |
| 44698.177083333336 | 5.86 |
| 44698.1875 | 5.66 |
| 44698.197916666664 | 5.53 |
| 44698.208333333336 | 5.39 |
| 44698.21875 | 5.2 |
| 44698.229166666664 | 5.02 |
| 44698.239583333336 | 4.87 |
| 44698.25 | 5.13 |
| 44698.260416666664 | 5.31 |
| 44698.270833333336 | 5.49 |
| 44698.28125 | 5.49 |
| 44698.291666666664 | 5.3 |
| 44698.302083333336 | 5.23 |
| 44698.3125 | 5.14 |
| 44698.322916666664 | 4.97 |
| 44698.333333333336 | 4.87 |
| 44698.34375 | 4.8 |
| 44698.354166666664 | 4.79 |
| 44698.364583333336 | 4.76 |
| 44698.375 | 4.75 |
| 44698.385416666664 | 4.7 |
| 44698.395833333336 | 4.71 |
| 44698.40625 | 4.77 |
| 44698.416666666664 | 4.9 |
| 44698.427083333336 | 4.97 |
| 44698.4375 | 5 |
| 44698.447916666664 | 5.07 |
| 44698.458333333336 | 5.1 |
| 44698.46875 | 5.12 |
| 44698.479166666664 | 5.15 |
| 44698.489583333336 | 5.2 |
| 44698.5 | 5.25 |
| 44698.510416666664 | 5.4 |
| 44698.520833333336 | 5.49 |
| 44698.53125 | 5.6 |
| 44698.541666666664 | 5.72 |
| 44698.552083333336 | 5.81 |
| 44698.5625 | 5.91 |
| 44698.572916666664 | 5.95 |
| 44698.583333333336 | 5.97 |
| 44698.59375 | 6 |
| 44698.604166666664 | 6.01 |
| 44698.614583333336 | 6 |
| 44698.625 | 6.02 |
| 44698.635416666664 | 6.11 |
| 44698.645833333336 | 6.16 |
| 44698.65625 | 6.34 |
| 44698.666666666664 | 6.51 |
| 44698.677083333336 | 6.65 |
| 44698.6875 | 6.89 |
| 44698.697916666664 | 6.85 |
| 44698.708333333336 | 6.98 |
| 44698.71875 | 6.87 |
| 44698.729166666664 | 6.87 |
| 44698.739583333336 | 7 |
| 44698.75 | 7.18 |
| 44698.760416666664 | 7.35 |
| 44698.770833333336 | 7.43 |
| 44698.78125 | 7.56 |
| 44698.791666666664 | 7.64 |
| 44698.802083333336 | 7.74 |
| 44698.8125 | 7.87 |
| 44698.822916666664 | 8 |
| 44698.833333333336 | 8.12 |
| 44698.84375 | 8.16 |
| 44698.854166666664 | 8.23 |
| 44698.864583333336 | 8.09 |
| 44698.875 | 7.83 |
| 44698.885416666664 | 7.59 |
| 44698.895833333336 | 7.55 |
| 44698.90625 | 7.44 |
| 44698.916666666664 | 7.26 |
| 44698.927083333336 | 7.06 |
| 44698.9375 | 6.95 |
| 44698.947916666664 | 6.77 |
| 44698.958333333336 | 6.6 |
| 44698.96875 | 6.44 |
| 44698.979166666664 | 6.37 |
| 44698.989583333336 | 6.34 |
| 44699.0 | 6.35 |
| 44699.010416666664 | 6.42 |
| 44699.020833333336 | 6.48 |
| 44699.03125 | 6.51 |
| 44699.041666666664 | 6.52 |
| 44699.052083333336 | 6.5 |
| 44699.0625 | 6.46 |
| 44699.072916666664 | 6.44 |
| 44699.083333333336 | 6.42 |
| 44699.09375 | 6.43 |
| 44699.104166666664 | 6.44 |
| 44699.114583333336 | 6.48 |
| 44699.125 | 6.4 |
| 44699.135416666664 | 6.4 |
| 44699.145833333336 | 6.4 |
| 44699.15625 | 6.42 |
| 44699.166666666664 | 6.34 |
| 44699.177083333336 | 6.21 |
| 44699.1875 | 6.12 |
| 44699.197916666664 | 6.07 |
| 44699.208333333336 | 5.87 |
| 44699.21875 | 5.67 |
| 44699.229166666664 | 5.46 |
| 44699.239583333336 | 5.27 |
| 44699.25 | 5.13 |
| 44699.260416666664 | 5.02 |
| 44699.270833333336 | 4.93 |
| 44699.28125 | 5.16 |
| 44699.291666666664 | 5.62 |
| 44699.302083333336 | 5.74 |
| 44699.3125 | 5.7 |
| 44699.322916666664 | 5.64 |
| 44699.333333333336 | 5.54 |
| 44699.34375 | 5.51 |
| 44699.354166666664 | 5.41 |
| 44699.364583333336 | 5.33 |
| 44699.375 | 5.26 |
| 44699.385416666664 | 5.2 |
| 44699.395833333336 | 5.11 |
| 44699.40625 | 5.15 |
| 44699.416666666664 | 5.1 |
| 44699.427083333336 | 5.06 |
| 44699.4375 | 5.09 |
| 44699.447916666664 | 5.14 |
| 44699.458333333336 | 5.22 |
| 44699.46875 | 5.19 |
| 44699.479166666664 | 5.19 |
| 44699.489583333336 | 5.22 |
| 44699.5 | 5.23 |
| 44699.510416666664 | 5.23 |
| 44699.520833333336 | 5.25 |
| 44699.53125 | 5.32 |
| 44699.541666666664 | 5.42 |
| 44699.552083333336 | 5.55 |
| 44699.5625 | 5.7 |
| 44699.572916666664 | 5.83 |
| 44699.583333333336 | 5.92 |
| 44699.59375 | 6.01 |
| 44699.604166666664 | 6.11 |
| 44699.614583333336 | 6.17 |
| 44699.625 | 6.21 |
| 44699.635416666664 | 6.23 |
| 44699.645833333336 | 6.26 |
| 44699.65625 | 6.21 |
| 44699.666666666664 | 6.59 |
| 44699.677083333336 | 6.73 |
| 44699.6875 | 6.87 |
| 44699.697916666664 | 6.86 |
| 44699.708333333336 | 7.08 |
| 44699.71875 | 7.24 |
| 44699.729166666664 | 7.38 |
| 44699.739583333336 | 7.4 |
| 44699.75 | 7.41 |
| 44699.760416666664 | 7.38 |
| 44699.770833333336 | 7.4 |
| 44699.78125 | 7.54 |
| 44699.791666666664 | 7.68 |
| 44699.802083333336 | 7.82 |
| 44699.8125 | 7.92 |
| 44699.822916666664 | 8.06 |
| 44699.833333333336 | 8.27 |
| 44699.84375 | 8.49 |
| 44699.854166666664 | 8.79 |
| 44699.864583333336 | 8.96 |
| 44699.875 | 9.06 |
| 44699.885416666664 | 9.06 |
| 44699.895833333336 | 9.09 |
| 44699.90625 | 8.9 |
| 44699.916666666664 | 8.68 |
| 44699.927083333336 | 8.31 |
| 44699.9375 | 8.08 |
| 44699.947916666664 | 7.76 |
| 44699.958333333336 | 7.41 |
| 44699.96875 | 7.13 |
| 44699.979166666664 | 6.97 |
| 44699.989583333336 | 6.86 |
| 44700.0 | 6.74 |
| 44700.010416666664 | 6.63 |
| 44700.020833333336 | 6.57 |
| 44700.03125 | 6.55 |
| 44700.041666666664 | 6.5 |
| 44700.052083333336 | 6.45 |
| 44700.0625 | 6.46 |
| 44700.072916666664 | 6.47 |
| 44700.083333333336 | 6.46 |
| 44700.09375 | 6.44 |
| 44700.104166666664 | 6.42 |
| 44700.114583333336 | 6.43 |
| 44700.125 | 6.42 |
| 44700.135416666664 | 6.43 |
| 44700.145833333336 | 6.41 |
| 44700.15625 | 6.42 |
| 44700.166666666664 | 6.45 |
| 44700.177083333336 | 6.35 |
| 44700.1875 | 6.34 |
| 44700.197916666664 | 6.37 |
| 44700.208333333336 | 6.32 |
| 44700.21875 | 6.32 |
| 44700.229166666664 | 6.32 |
| 44700.239583333336 | 6.21 |
| 44700.25 | 6.15 |
| 44700.260416666664 | 6.04 |
| 44700.270833333336 | 5.93 |
| 44700.28125 | 5.86 |
| 44700.291666666664 | 5.76 |
| 44700.302083333336 | 5.72 |
| 44700.3125 | 5.94 |
| 44700.322916666664 | 5.95 |
| 44700.333333333336 | 5.93 |
| 44700.34375 | 6.01 |
| 44700.354166666664 | 6.03 |
| 44700.364583333336 | 6.12 |
| 44700.375 | 6.13 |
| 44700.385416666664 | 6.13 |
| 44700.395833333336 | 6.09 |
| 44700.40625 | 6.02 |
| 44700.416666666664 | 6 |
| 44700.427083333336 | 5.95 |
| 44700.4375 | 5.93 |
| 44700.447916666664 | 5.86 |
| 44700.458333333336 | 5.8 |
| 44700.46875 | 5.77 |
| 44700.479166666664 | 5.77 |
| 44700.489583333336 | 5.8 |
| 44700.5 | 5.82 |
| 44700.510416666664 | 5.84 |
| 44700.520833333336 | 5.86 |
| 44700.53125 | 5.88 |
| 44700.541666666664 | 5.9 |
| 44700.552083333336 | 5.9 |
| 44700.5625 | 5.91 |
| 44700.572916666664 | 5.95 |
| 44700.583333333336 | 5.98 |
| 44700.59375 | 6.04 |
| 44700.604166666664 | 6.14 |
| 44700.614583333336 | 6.22 |
| 44700.625 | 6.29 |
| 44700.635416666664 | 6.33 |
| 44700.645833333336 | 6.37 |
| 44700.65625 | 6.34 |
| 44700.666666666664 | 6.31 |
| 44700.677083333336 | 6.34 |
| 44700.6875 | 6.39 |
| 44700.697916666664 | 6.48 |
| 44700.708333333336 | 6.58 |
| 44700.71875 | 6.81 |
| 44700.729166666664 | 7.01 |
| 44700.739583333336 | 7.06 |
| 44700.75 | 7.13 |
| 44700.760416666664 | 7.29 |
| 44700.770833333336 | 7.35 |
| 44700.78125 | 7.49 |
| 44700.791666666664 | 7.44 |
| 44700.802083333336 | 7.52 |
| 44700.8125 | 7.67 |
| 44700.822916666664 | 7.99 |
| 44700.833333333336 | 8.25 |
| 44700.84375 | 8.46 |
| 44700.854166666664 | 8.6 |
| 44700.864583333336 | 8.73 |
| 44700.875 | 9.03 |
| 44700.885416666664 | 9.37 |
| 44700.895833333336 | 9.65 |
| 44700.90625 | 9.81 |
| 44700.916666666664 | 9.86 |
| 44700.927083333336 | 9.83 |
| 44700.9375 | 9.6 |
| 44700.947916666664 | 9.33 |
| 44700.958333333336 | 8.91 |
| 44700.96875 | 8.66 |
| 44700.979166666664 | 8.34 |
| 44700.989583333336 | 7.93 |
| 44701.0 | 7.56 |
| 44701.010416666664 | 7.29 |
| 44701.020833333336 | 7.08 |
| 44701.03125 | 6.81 |
| 44701.041666666664 | 6.53 |
| 44701.052083333336 | 6.35 |
| 44701.0625 | 6.26 |
| 44701.072916666664 | 6.23 |
| 44701.083333333336 | 6.26 |
| 44701.09375 | 6.29 |
| 44701.104166666664 | 6.32 |
| 44701.114583333336 | 6.36 |
| 44701.125 | 6.37 |
| 44701.135416666664 | 6.38 |
| 44701.145833333336 | 6.4 |
| 44701.15625 | 6.38 |
| 44701.166666666664 | 6.23 |
| 44701.177083333336 | 6.39 |
| 44701.1875 | 6.24 |
| 44701.197916666664 | 6.26 |
| 44701.208333333336 | 6.19 |
| 44701.21875 | 6 |
| 44701.229166666664 | 6.3 |
| 44701.239583333336 | 6.26 |
| 44701.25 | 6.11 |
| 44701.260416666664 | 5.99 |
| 44701.270833333336 | 5.91 |
| 44701.28125 | 5.72 |
| 44701.291666666664 | 5.53 |
| 44701.302083333336 | 5.39 |
| 44701.3125 | 5.28 |
| 44701.322916666664 | 5.2 |
| 44701.333333333336 | 5.03 |
| 44701.34375 | 4.9 |
| 44701.354166666664 | 4.8 |
| 44701.364583333336 | 4.79 |
| 44701.375 | 5.02 |
| 44701.385416666664 | 5.55 |
| 44701.395833333336 | 5.69 |
| 44701.40625 | 5.8 |
| 44701.416666666664 | 5.74 |
| 44701.427083333336 | 5.73 |
| 44701.4375 | 5.72 |
| 44701.447916666664 | 5.67 |
| 44701.458333333336 | 5.63 |
| 44701.46875 | 5.56 |
| 44701.479166666664 | 5.6 |
| 44701.489583333336 | 5.46 |
| 44701.5 | 5.45 |
| 44701.510416666664 | 5.44 |
| 44701.520833333336 | 5.39 |
| 44701.53125 | 5.33 |
| 44701.541666666664 | 5.26 |
| 44701.552083333336 | 5.27 |
| 44701.5625 | 5.39 |
| 44701.572916666664 | 5.35 |
| 44701.583333333336 | 5.34 |
| 44701.59375 | 5.35 |
| 44701.604166666664 | 5.33 |
| 44701.614583333336 | 5.32 |
| 44701.625 | 5.32 |
| 44701.635416666664 | 5.36 |
| 44701.645833333336 | 5.46 |
| 44701.65625 | 5.58 |
| 44701.666666666664 | 5.67 |
| 44701.677083333336 | 5.76 |
| 44701.6875 | 5.81 |
| 44701.697916666664 | 5.89 |
| 44701.708333333336 | 5.94 |
| 44701.71875 | 5.93 |
| 44701.729166666664 | 5.78 |
| 44701.739583333336 | 5.79 |
| 44701.75 | 6 |
| 44701.760416666664 | 6.34 |
| 44701.770833333336 | 6.83 |
| 44701.78125 | 7.1 |
| 44701.791666666664 | 7.21 |
| 44701.802083333336 | 7.1 |
| 44701.8125 | 7 |
| 44701.822916666664 | 7.21 |
| 44701.833333333336 | 7.28 |
| 44701.84375 | 7.44 |
| 44701.854166666664 | 7.26 |
| 44701.864583333336 | 7.4 |
| 44701.875 | 7.41 |
| 44701.885416666664 | 7.77 |
| 44701.895833333336 | 7.86 |
| 44701.90625 | 8.06 |
| 44701.916666666664 | 8.28 |
| 44701.927083333336 | 8.44 |
| 44701.9375 | 8.53 |
| 44701.947916666664 | 8.56 |
| 44701.958333333336 | 8.54 |
| 44701.96875 | 8.49 |
| 44701.979166666664 | 8.18 |
| 44701.989583333336 | 7.96 |
| 44702.0 | 7.79 |
| 44702.010416666664 | 7.59 |
| 44702.020833333336 | 7.32 |
| 44702.03125 | 6.97 |
| 44702.041666666664 | 6.69 |
| 44702.052083333336 | 6.5 |
| 44702.0625 | 6.36 |
| 44702.072916666664 | 6.23 |
| 44702.083333333336 | 6.13 |
| 44702.09375 | 6.06 |
| 44702.104166666664 | 5.98 |
| 44702.114583333336 | 5.92 |
| 44702.125 | 5.88 |
| 44702.135416666664 | 5.87 |
| 44702.145833333336 | 5.87 |
| 44702.15625 | 5.89 |
| 44702.166666666664 | 5.89 |
| 44702.177083333336 | 5.9 |
| 44702.1875 | 5.91 |
| 44702.197916666664 | 5.98 |
| 44702.208333333336 | 5.92 |
| 44702.21875 | 5.91 |
| 44702.229166666664 | 5.88 |
| 44702.239583333336 | 5.85 |
| 44702.25 | 5.71 |
| 44702.260416666664 | 5.77 |
| 44702.270833333336 | 5.78 |
| 44702.28125 | 5.7 |
| 44702.291666666664 | 5.62 |
| 44702.302083333336 | 5.41 |
| 44702.3125 | 5.3 |
| 44702.322916666664 | 5.12 |
| 44702.333333333336 | 5.03 |
| 44702.34375 | 5 |
| 44702.354166666664 | 4.83 |
| 44702.364583333336 | 4.65 |
| 44702.375 | 4.61 |
| 44702.385416666664 | 4.64 |
| 44702.395833333336 | 4.9 |
| 44702.40625 | 4.89 |
| 44702.416666666664 | 5.16 |
| 44702.427083333336 | 5.26 |
| 44702.4375 | 5.27 |
| 44702.447916666664 | 5.21 |
| 44702.458333333336 | 5.22 |
| 44702.46875 | 5.18 |
| 44702.479166666664 | 5.18 |
| 44702.489583333336 | 5.15 |
| 44702.5 | 5.15 |
| 44702.510416666664 | 5.11 |
| 44702.520833333336 | 5.1 |
| 44702.53125 | 5.02 |
| 44702.541666666664 | 4.88 |
| 44702.552083333336 | 4.91 |
| 44702.5625 | 4.96 |
| 44702.572916666664 | 5.01 |
| 44702.583333333336 | 5.13 |
| 44702.59375 | 5.24 |
| 44702.604166666664 | 5.27 |
| 44702.614583333336 | 5.25 |
| 44702.625 | 5.28 |
| 44702.635416666664 | 5.3 |
| 44702.645833333336 | 5.31 |
| 44702.65625 | 5.38 |
| 44702.666666666664 | 5.44 |
| 44702.677083333336 | 5.5 |
| 44702.6875 | 5.55 |
| 44702.697916666664 | 5.66 |
| 44702.708333333336 | 5.73 |
| 44702.71875 | 5.91 |
| 44702.729166666664 | 5.93 |
| 44702.739583333336 | 6.06 |
| 44702.75 | 6 |
| 44702.760416666664 | 6.1 |
| 44702.770833333336 | 5.73 |
| 44702.78125 | 5.91 |
| 44702.791666666664 | 6.1 |
| 44702.802083333336 | 6.41 |
| 44702.8125 | 6.38 |
| 44702.822916666664 | 6.62 |
| 44702.833333333336 | 6.86 |
| 44702.84375 | 6.76 |
| 44702.854166666664 | 6.8 |
| 44702.864583333336 | 6.82 |
| 44702.875 | 6.77 |
| 44702.885416666664 | 6.78 |
| 44702.895833333336 | 6.72 |
| 44702.90625 | 6.98 |
| 44702.916666666664 | 7.32 |
| 44702.927083333336 | 7.54 |
| 44702.9375 | 7.59 |
| 44702.947916666664 | 7.72 |
| 44702.958333333336 | 7.75 |
| 44702.96875 | 7.85 |
| 44702.979166666664 | 7.88 |
| 44702.989583333336 | 7.88 |
| 44703.0 | 7.84 |
| 44703.010416666664 | 7.78 |
| 44703.020833333336 | 7.52 |
| 44703.03125 | 7.32 |
| 44703.041666666664 | 7.08 |
| 44703.052083333336 | 6.94 |
| 44703.0625 | 6.71 |
| 44703.072916666664 | 6.37 |
| 44703.083333333336 | 6.15 |
| 44703.09375 | 6.04 |
| 44703.104166666664 | 5.95 |
| 44703.114583333336 | 5.88 |
| 44703.125 | 5.82 |
| 44703.135416666664 | 5.77 |
| 44703.145833333336 | 5.76 |
| 44703.15625 | 5.75 |
| 44703.166666666664 | 5.79 |
| 44703.177083333336 | 5.76 |
| 44703.1875 | 5.77 |
| 44703.197916666664 | 5.79 |
| 44703.208333333336 | 5.79 |
| 44703.21875 | 5.81 |
| 44703.229166666664 | 5.8 |
| 44703.239583333336 | 5.8 |
| 44703.25 | 5.81 |
| 44703.260416666664 | 5.79 |
| 44703.270833333336 | 5.77 |
| 44703.28125 | 5.75 |
| 44703.291666666664 | 5.59 |
| 44703.302083333336 | 5.58 |
| 44703.3125 | 5.63 |
| 44703.322916666664 | 5.58 |
| 44703.333333333336 | 5.47 |
| 44703.34375 | 5.3 |
| 44703.354166666664 | 5.17 |
| 44703.364583333336 | 5.09 |
| 44703.375 | 4.93 |
| 44703.385416666664 | 4.82 |
| 44703.395833333336 | 4.58 |
| 44703.40625 | 4.53 |
| 44703.416666666664 | 4.52 |
| 44703.427083333336 | 4.75 |
| 44703.4375 | 4.83 |
| 44703.447916666664 | 4.94 |
| 44703.458333333336 | 4.95 |
| 44703.46875 | 4.93 |
| 44703.479166666664 | 4.92 |
| 44703.489583333336 | 4.92 |
| 44703.5 | 4.93 |
| 44703.510416666664 | 4.93 |
| 44703.520833333336 | 4.95 |
| 44703.53125 | 4.96 |
| 44703.541666666664 | 5.04 |
| 44703.552083333336 | 5.02 |
| 44703.5625 | 4.98 |
| 44703.572916666664 | 4.87 |
| 44703.583333333336 | 4.75 |
| 44703.59375 | 4.78 |
| 44703.604166666664 | 4.91 |
| 44703.614583333336 | 4.97 |
| 44703.625 | 5.04 |
| 44703.635416666664 | 5.13 |
| 44703.645833333336 | 5.18 |
| 44703.65625 | 5.21 |
| 44703.666666666664 | 5.27 |
| 44703.677083333336 | 5.34 |
| 44703.6875 | 5.42 |
| 44703.697916666664 | 5.49 |
| 44703.708333333336 | 5.57 |
| 44703.71875 | 5.58 |
| 44703.729166666664 | 5.59 |
| 44703.739583333336 | 5.63 |
| 44703.75 | 5.7 |
| 44703.760416666664 | 5.78 |
| 44703.770833333336 | 5.78 |
| 44703.78125 | 5.86 |
| 44703.791666666664 | 5.97 |
| 44703.802083333336 | 5.97 |
| 44703.8125 | 5.75 |
| 44703.822916666664 | 5.93 |
| 44703.833333333336 | 6.05 |
| 44703.84375 | 6.08 |
| 44703.854166666664 | 6.03 |
| 44703.864583333336 | 6.68 |
| 44703.875 | 6.49 |
| 44703.885416666664 | 6.56 |
| 44703.895833333336 | 6.75 |
| 44703.90625 | 6.66 |
| 44703.916666666664 | 6.59 |
| 44703.927083333336 | 6.58 |
| 44703.9375 | 6.89 |
| 44703.947916666664 | 7.32 |
| 44703.958333333336 | 7.67 |
| 44703.96875 | 7.93 |
| 44703.979166666664 | 7.89 |
| 44703.989583333336 | 8.04 |
| 44704.0 | 8.15 |
| 44704.010416666664 | 8.15 |
| 44704.020833333336 | 8.12 |
| 44704.03125 | 8.15 |
| 44704.041666666664 | 8.18 |
| 44704.052083333336 | 8.14 |
| 44704.0625 | 8.14 |
| 44704.072916666664 | 7.74 |
| 44704.083333333336 | 7.68 |
| 44704.09375 | 7.59 |
| 44704.104166666664 | 7.36 |
| 44704.114583333336 | 7.19 |
| 44704.125 | 6.8 |
| 44704.135416666664 | 6.41 |
| 44704.145833333336 | 6.12 |
| 44704.15625 | 5.85 |
| 44704.166666666664 | 5.62 |
| 44704.177083333336 | 5.42 |
| 44704.1875 | 5.28 |
| 44704.197916666664 | 5.18 |
| 44704.208333333336 | 5.1 |
| 44704.21875 | 5.06 |
| 44704.229166666664 | 5.03 |
| 44704.239583333336 | 5.04 |
| 44704.25 | 5.06 |
| 44704.260416666664 | 5.08 |
| 44704.270833333336 | 5.11 |
| 44704.28125 | 5.16 |
| 44704.291666666664 | 5.18 |
| 44704.302083333336 | 5.2 |
| 44704.3125 | 5.22 |
| 44704.322916666664 | 5.18 |
| 44704.333333333336 | 5.11 |
| 44704.34375 | 5.12 |
| 44704.354166666664 | 5.16 |
| 44704.364583333336 | 5.03 |
| 44704.375 | 4.93 |
| 44704.385416666664 | 4.75 |
| 44704.395833333336 | 4.48 |
| 44704.40625 | 4.27 |
| 44704.416666666664 | 4.03 |
| 44704.427083333336 | 3.96 |
| 44704.4375 | 3.78 |
| 44704.447916666664 | 3.75 |
| 44704.458333333336 | 4.41 |
| 44704.46875 | 4.4 |
| 44704.479166666664 | 4.55 |
| 44704.489583333336 | 4.52 |
| 44704.5 | 4.57 |
| 44704.510416666664 | 4.68 |
| 44704.520833333336 | 4.75 |
| 44704.53125 | 4.85 |
| 44704.541666666664 | 4.9 |
| 44704.552083333336 | 4.96 |
| 44704.5625 | 5.02 |
| 44704.572916666664 | 5.04 |
| 44704.583333333336 | 5.02 |
| 44704.59375 | 5.08 |
| 44704.604166666664 | 4.91 |
| 44704.614583333336 | 4.84 |
| 44704.625 | 4.66 |
| 44704.635416666664 | 4.58 |
| 44704.645833333336 | 4.59 |
| 44704.65625 | 4.56 |
| 44704.666666666664 | 4.54 |
| 44704.677083333336 | 4.6 |
| 44704.6875 | 4.71 |
| 44704.697916666664 | 4.77 |
| 44704.708333333336 | 4.82 |
| 44704.71875 | 4.88 |
| 44704.729166666664 | 4.9 |
| 44704.739583333336 | 4.95 |
| 44704.75 | 5.03 |
| 44704.760416666664 | 5.16 |
| 44704.770833333336 | 5.27 |
| 44704.78125 | 5.35 |
| 44704.791666666664 | 5.39 |
| 44704.802083333336 | 5.43 |
| 44704.8125 | 5.49 |
| 44704.822916666664 | 5.54 |
| 44704.833333333336 | 5.5 |
| 44704.84375 | 5.6 |
| 44704.854166666664 | 5.65 |
| 44704.864583333336 | 5.79 |
| 44704.875 | 5.84 |
| 44704.885416666664 | 5.95 |
| 44704.895833333336 | 5.98 |
| 44704.90625 | 6.08 |
| 44704.916666666664 | 6.17 |
| 44704.927083333336 | 6.31 |
| 44704.9375 | 6.43 |
| 44704.947916666664 | 6.55 |
| 44704.958333333336 | 6.55 |
| 44704.96875 | 6.61 |
| 44704.979166666664 | 6.72 |
| 44704.989583333336 | 6.97 |
| 44705.0 | 7.08 |
| 44705.010416666664 | 7.1 |
| 44705.020833333336 | 7.26 |
| 44705.03125 | 7.24 |
| 44705.041666666664 | 7.19 |
| 44705.052083333336 | 7.12 |
| 44705.0625 | 7.06 |
| 44705.072916666664 | 7.05 |
| 44705.083333333336 | 7.09 |
| 44705.09375 | 7.12 |
| 44705.104166666664 | 7.13 |
| 44705.114583333336 | 7.1 |
| 44705.125 | 6.95 |
| 44705.135416666664 | 6.81 |
| 44705.145833333336 | 6.73 |
| 44705.15625 | 6.63 |
| 44705.166666666664 | 6.55 |
| 44705.177083333336 | 6.52 |
| 44705.1875 | 6.41 |
| 44705.197916666664 | 6.22 |
| 44705.208333333336 | 6.02 |
| 44705.21875 | 5.88 |
| 44705.229166666664 | 5.74 |
| 44705.239583333336 | 5.63 |
| 44705.25 | 5.52 |
| 44705.260416666664 | 5.43 |
| 44705.270833333336 | 5.36 |
| 44705.28125 | 5.32 |
| 44705.291666666664 | 5.27 |
| 44705.302083333336 | 5.25 |
| 44705.3125 | 5.26 |
| 44705.322916666664 | 5.26 |
| 44705.333333333336 | 5.24 |
| 44705.34375 | 5.24 |
| 44705.354166666664 | 5.26 |
| 44705.364583333336 | 5.28 |
| 44705.375 | 5.27 |
| 44705.385416666664 | 5.25 |
| 44705.395833333336 | 5.19 |
| 44705.40625 | 5.1 |
| 44705.416666666664 | 5.09 |
| 44705.427083333336 | 5.05 |
| 44705.4375 | 5.08 |
| 44705.447916666664 | 5.09 |
| 44705.458333333336 | 5.14 |
| 44705.46875 | 5.1 |
| 44705.479166666664 | 5.29 |
| 44705.489583333336 | 5.39 |
| 44705.5 | 5.45 |
| 44705.510416666664 | 5.47 |
| 44705.520833333336 | 5.52 |
| 44705.53125 | 5.55 |
| 44705.541666666664 | 5.56 |
| 44705.552083333336 | 5.58 |
| 44705.5625 | 5.61 |
| 44705.572916666664 | 5.61 |
| 44705.583333333336 | 5.63 |
| 44705.59375 | 5.66 |
| 44705.604166666664 | 5.67 |
| 44705.614583333336 | 5.69 |
| 44705.625 | 5.72 |
| 44705.635416666664 | 5.76 |
| 44705.645833333336 | 5.7 |
| 44705.65625 | 5.67 |
| 44705.666666666664 | 5.68 |
| 44705.677083333336 | 5.68 |
| 44705.6875 | 5.69 |
| 44705.697916666664 | 5.7 |
| 44705.708333333336 | 5.72 |
| 44705.71875 | 5.78 |
| 44705.729166666664 | 5.82 |
| 44705.739583333336 | 5.9 |
| 44705.75 | 5.99 |
| 44705.760416666664 | 6.12 |
| 44705.770833333336 | 6.19 |
| 44705.78125 | 6.25 |
| 44705.791666666664 | 6.3 |
| 44705.802083333336 | 6.34 |
| 44705.8125 | 6.37 |
| 44705.822916666664 | 6.42 |
| 44705.833333333336 | 6.45 |
| 44705.84375 | 6.49 |
| 44705.854166666664 | 6.5 |
| 44705.864583333336 | 6.53 |
| 44705.875 | 6.52 |
| 44705.885416666664 | 6.66 |
| 44705.895833333336 | 6.71 |
| 44705.90625 | 6.82 |
| 44705.916666666664 | 6.9 |
| 44705.927083333336 | 6.95 |
| 44705.9375 | 6.97 |
| 44705.947916666664 | 6.89 |
| 44705.958333333336 | 6.88 |
| 44705.96875 | 6.96 |
| 44705.979166666664 | 7.04 |
| 44705.989583333336 | 7.07 |
| 44706.0 | 7.04 |
| 44706.010416666664 | 7.02 |
| 44706.020833333336 | 6.95 |
| 44706.03125 | 6.92 |
| 44706.041666666664 | 6.84 |
| 44706.052083333336 | 6.82 |
| 44706.0625 | 6.77 |
| 44706.072916666664 | 6.76 |
| 44706.083333333336 | 6.76 |
| 44706.09375 | 6.78 |
| 44706.104166666664 | 6.83 |
| 44706.114583333336 | 6.83 |
| 44706.125 | 6.83 |
| 44706.135416666664 | 6.83 |
| 44706.145833333336 | 6.79 |
| 44706.15625 | 6.75 |
| 44706.166666666664 | 6.75 |
| 44706.177083333336 | 6.75 |
| 44706.1875 | 6.71 |
| 44706.197916666664 | 6.68 |
| 44706.208333333336 | 6.65 |
| 44706.21875 | 6.64 |
| 44706.229166666664 | 6.65 |
| 44706.239583333336 | 6.67 |
| 44706.25 | 6.69 |
| 44706.260416666664 | 6.74 |
| 44706.270833333336 | 6.77 |
| 44706.28125 | 6.8 |
| 44706.291666666664 | 6.85 |
| 44706.302083333336 | 6.89 |
| 44706.3125 | 6.92 |
| 44706.322916666664 | 6.94 |
| 44706.333333333336 | 6.95 |
| 44706.34375 | 6.96 |
| 44706.354166666664 | 6.96 |
| 44706.364583333336 | 6.99 |
| 44706.375 | 7 |
| 44706.385416666664 | 7.02 |
| 44706.395833333336 | 6.95 |
| 44706.40625 | 6.97 |
| 44706.416666666664 | 7 |
| 44706.427083333336 | 6.89 |
| 44706.4375 | 6.92 |
| 44706.447916666664 | 6.93 |
| 44706.458333333336 | 6.91 |
| 44706.46875 | 6.95 |
| 44706.479166666664 | 6.94 |
| 44706.489583333336 | 6.9 |
| 44706.5 | 6.84 |
| 44706.510416666664 | 6.78 |
| 44706.520833333336 | 6.8 |
| 44706.53125 | 6.78 |
| 44706.541666666664 | 6.8 |
| 44706.552083333336 | 6.8 |
| 44706.5625 | 6.83 |
| 44706.572916666664 | 6.86 |
| 44706.583333333336 | 6.96 |
| 44706.59375 | 7.04 |
| 44706.604166666664 | 7.18 |
| 44706.614583333336 | 7.28 |
| 44706.625 | 7.36 |
| 44706.635416666664 | 7.41 |
| 44706.645833333336 | 7.4 |
| 44706.65625 | 7.4 |
| 44706.666666666664 | 7.39 |
| 44706.677083333336 | 7.42 |
| 44706.6875 | 7.41 |
| 44706.697916666664 | 7.39 |
| 44706.708333333336 | 7.36 |
| 44706.71875 | 7.38 |
| 44706.729166666664 | 7.34 |
| 44706.739583333336 | 7.35 |
| 44706.75 | 7.36 |
| 44706.760416666664 | 7.37 |
| 44706.770833333336 | 7.37 |
| 44706.78125 | 7.39 |
| 44706.791666666664 | 7.43 |
| 44706.802083333336 | 7.46 |
| 44706.8125 | 7.48 |
| 44706.822916666664 | 7.49 |
| 44706.833333333336 | 7.51 |
| 44706.84375 | 7.52 |
| 44706.854166666664 | 7.52 |
| 44706.864583333336 | 7.52 |
| 44706.875 | 7.53 |
| 44706.885416666664 | 7.53 |
| 44706.895833333336 | 7.52 |
| 44706.90625 | 7.56 |
| 44706.916666666664 | 7.53 |
| 44706.927083333336 | 7.58 |
| 44706.9375 | 7.74 |
| 44706.947916666664 | 7.71 |
| 44706.958333333336 | 7.66 |
| 44706.96875 | 7.67 |
| 44706.979166666664 | 7.66 |
| 44706.989583333336 | 7.67 |
| 44707.0 | 7.64 |
| 44707.010416666664 | 7.63 |
| 44707.020833333336 | 7.62 |
| 44707.03125 | 7.63 |
| 44707.041666666664 | 7.57 |
| 44707.052083333336 | 7.48 |
| 44707.0625 | 7.38 |
| 44707.072916666664 | 7.23 |
| 44707.083333333336 | 7.11 |
| 44707.09375 | 7 |
| 44707.104166666664 | 7.02 |
| 44707.114583333336 | 7.07 |
| 44707.125 | 7.07 |
| 44707.135416666664 | 7.1 |
| 44707.145833333336 | 7.09 |
| 44707.15625 | 7.08 |
| 44707.166666666664 | 7.18 |
| 44707.177083333336 | 7.29 |
| 44707.1875 | 7.33 |
| 44707.197916666664 | 7.32 |
| 44707.208333333336 | 7.3 |
| 44707.21875 | 7.12 |
| 44707.229166666664 | 7.08 |
| 44707.239583333336 | 7.05 |
| 44707.25 | 7.01 |
| 44707.260416666664 | 6.99 |
| 44707.270833333336 | 6.97 |
| 44707.28125 | 6.94 |
| 44707.291666666664 | 6.93 |
| 44707.302083333336 | 6.91 |
| 44707.3125 | 6.89 |
| 44707.322916666664 | 6.88 |
| 44707.333333333336 | 6.86 |
| 44707.34375 | 6.86 |
| 44707.354166666664 | 6.86 |
| 44707.364583333336 | 6.87 |
| 44707.375 | 6.88 |
| 44707.385416666664 | 6.88 |
| 44707.395833333336 | 6.88 |
| 44707.40625 | 6.89 |
| 44707.416666666664 | 6.9 |
| 44707.427083333336 | 6.88 |
| 44707.4375 | 6.87 |
| 44707.447916666664 | 6.94 |
| 44707.458333333336 | 6.81 |
| 44707.46875 | 6.8 |
| 44707.479166666664 | 6.76 |
| 44707.489583333336 | 6.77 |
| 44707.5 | 6.78 |
| 44707.510416666664 | 6.76 |
| 44707.520833333336 | 6.71 |
| 44707.53125 | 6.71 |
| 44707.541666666664 | 6.63 |
| 44707.552083333336 | 6.57 |
| 44707.5625 | 6.55 |
| 44707.572916666664 | 6.58 |
| 44707.583333333336 | 6.65 |
| 44707.59375 | 6.73 |
| 44707.604166666664 | 6.8 |
| 44707.614583333336 | 6.88 |
| 44707.625 | 6.99 |
| 44707.635416666664 | 7.06 |
| 44707.645833333336 | 7.22 |
| 44707.65625 | 7.32 |
| 44707.666666666664 | 7.39 |
| 44707.677083333336 | 7.41 |
| 44707.6875 | 7.42 |
| 44707.697916666664 | 7.47 |
| 44707.708333333336 | 7.49 |
| 44707.71875 | 7.41 |
| 44707.729166666664 | 7.31 |
| 44707.739583333336 | 7.18 |
| 44707.75 | 7.18 |
| 44707.760416666664 | 7.21 |
| 44707.770833333336 | 7.2 |
| 44707.78125 | 7.15 |
| 44707.791666666664 | 7.08 |
| 44707.802083333336 | 7.07 |
| 44707.8125 | 7.03 |
| 44707.822916666664 | 6.98 |
| 44707.833333333336 | 6.93 |
| 44707.84375 | 6.89 |
| 44707.854166666664 | 6.85 |
| 44707.864583333336 | 6.83 |
| 44707.875 | 6.81 |
| 44707.885416666664 | 6.81 |
| 44707.895833333336 | 6.81 |
| 44707.90625 | 6.86 |
| 44707.916666666664 | 6.88 |
| 44707.927083333336 | 6.9 |
| 44707.9375 | 6.91 |
| 44707.947916666664 | 6.92 |
| 44707.958333333336 | 6.91 |
| 44707.96875 | 6.85 |
| 44707.979166666664 | 6.87 |
| 44707.989583333336 | 6.88 |
| 44708.0 | 6.88 |
| 44708.010416666664 | 6.85 |
| 44708.020833333336 | 6.82 |
| 44708.03125 | 6.79 |
| 44708.041666666664 | 6.81 |
| 44708.052083333336 | 6.79 |
| 44708.0625 | 6.71 |
| 44708.072916666664 | 6.58 |
| 44708.083333333336 | 6.45 |
| 44708.09375 | 6.28 |
| 44708.104166666664 | 6.24 |
| 44708.114583333336 | 6.23 |
| 44708.125 | 6.02 |
| 44708.135416666664 | 6.15 |
| 44708.145833333336 | 6.34 |
| 44708.15625 | 6.64 |
| 44708.166666666664 | 6.72 |
| 44708.177083333336 | 6.81 |
| 44708.1875 | 6.87 |
| 44708.197916666664 | 6.88 |
| 44708.208333333336 | 6.9 |
| 44708.21875 | 6.89 |
| 44708.229166666664 | 6.84 |
| 44708.239583333336 | 6.79 |
| 44708.25 | 6.69 |
| 44708.260416666664 | 6.62 |
| 44708.270833333336 | 6.53 |
| 44708.28125 | 6.5 |
| 44708.291666666664 | 6.46 |
| 44708.302083333336 | 6.37 |
| 44708.3125 | 6.27 |
| 44708.322916666664 | 6.24 |
| 44708.333333333336 | 6.2 |
| 44708.34375 | 6.16 |
| 44708.354166666664 | 6.13 |
| 44708.364583333336 | 6.08 |
| 44708.375 | 6.04 |
| 44708.385416666664 | 5.99 |
| 44708.395833333336 | 5.94 |
| 44708.40625 | 5.93 |
| 44708.416666666664 | 5.92 |
| 44708.427083333336 | 5.91 |
| 44708.4375 | 5.92 |
| 44708.447916666664 | 5.94 |
| 44708.458333333336 | 5.96 |
| 44708.46875 | 5.99 |
| 44708.479166666664 | 5.97 |
| 44708.489583333336 | 5.89 |
| 44708.5 | 5.84 |
| 44708.510416666664 | 5.89 |
| 44708.520833333336 | 5.89 |
| 44708.53125 | 5.86 |
| 44708.541666666664 | 5.86 |
| 44708.552083333336 | 5.81 |
| 44708.5625 | 5.94 |
| 44708.572916666664 | 5.92 |
| 44708.583333333336 | 5.91 |
| 44708.59375 | 5.98 |
| 44708.604166666664 | 6.06 |
| 44708.614583333336 | 6.15 |
| 44708.625 | 6.26 |
| 44708.635416666664 | 6.41 |
| 44708.645833333336 | 6.56 |
| 44708.65625 | 6.66 |
| 44708.666666666664 | 6.76 |
| 44708.677083333336 | 6.87 |
| 44708.6875 | 6.94 |
| 44708.697916666664 | 6.99 |
| 44708.708333333336 | 7 |
| 44708.71875 | 7.02 |
| 44708.729166666664 | 6.85 |
| 44708.739583333336 | 6.8 |
| 44708.75 | 6.72 |
| 44708.760416666664 | 6.59 |
| 44708.770833333336 | 6.49 |
| 44708.78125 | 6.48 |
| 44708.791666666664 | 6.44 |
| 44708.802083333336 | 6.41 |
| 44708.8125 | 6.41 |
| 44708.822916666664 | 6.43 |
| 44708.833333333336 | 6.41 |
| 44708.84375 | 6.45 |
| 44708.854166666664 | 6.45 |
| 44708.864583333336 | 6.45 |
| 44708.875 | 6.44 |
| 44708.885416666664 | 6.43 |
| 44708.895833333336 | 6.43 |
| 44708.90625 | 6.45 |
| 44708.916666666664 | 6.44 |
| 44708.927083333336 | 6.44 |
| 44708.9375 | 6.45 |
| 44708.947916666664 | 6.49 |
| 44708.958333333336 | 6.52 |
| 44708.96875 | 6.51 |
| 44708.979166666664 | 6.51 |
| 44708.989583333336 | 6.49 |
| 44709.0 | 6.48 |
| 44709.010416666664 | 6.47 |
| 44709.020833333336 | 6.34 |
| 44709.03125 | 6.31 |
| 44709.041666666664 | 6.4 |
| 44709.052083333336 | 6.38 |
| 44709.0625 | 6.4 |
| 44709.072916666664 | 6.34 |
| 44709.083333333336 | 6.23 |
| 44709.09375 | 6.13 |
| 44709.104166666664 | 6.11 |
| 44709.114583333336 | 6.01 |
| 44709.125 | 5.98 |
| 44709.135416666664 | 5.91 |
| 44709.145833333336 | 5.79 |
| 44709.15625 | 5.77 |
| 44709.166666666664 | 5.82 |
| 44709.177083333336 | 5.74 |
| 44709.1875 | 5.94 |
| 44709.197916666664 | 6.05 |
| 44709.208333333336 | 6.13 |
| 44709.21875 | 6.2 |
| 44709.229166666664 | 6.27 |
| 44709.239583333336 | 6.27 |
| 44709.25 | 6.28 |
| 44709.260416666664 | 6.28 |
| 44709.270833333336 | 6.23 |
| 44709.28125 | 6.19 |
| 44709.291666666664 | 6.09 |
| 44709.302083333336 | 6.01 |
| 44709.3125 | 5.94 |
| 44709.322916666664 | 5.92 |
| 44709.333333333336 | 5.89 |
| 44709.34375 | 5.84 |
| 44709.354166666664 | 5.82 |
| 44709.364583333336 | 5.8 |
| 44709.375 | 5.76 |
| 44709.385416666664 | 5.74 |
| 44709.395833333336 | 5.72 |
| 44709.40625 | 5.68 |
| 44709.416666666664 | 5.66 |
| 44709.427083333336 | 5.63 |
| 44709.4375 | 5.63 |
| 44709.447916666664 | 5.64 |
| 44709.458333333336 | 5.65 |
| 44709.46875 | 5.66 |
| 44709.479166666664 | 5.71 |
| 44709.489583333336 | 5.73 |
| 44709.5 | 5.76 |
| 44709.510416666664 | 5.7 |
| 44709.520833333336 | 5.84 |
| 44709.53125 | 5.78 |
| 44709.541666666664 | 5.82 |
| 44709.552083333336 | 5.77 |
| 44709.5625 | 5.9 |
| 44709.572916666664 | 5.9 |
| 44709.583333333336 | 5.99 |
| 44709.59375 | 6.06 |
| 44709.604166666664 | 6.21 |
| 44709.614583333336 | 6.18 |
| 44709.625 | 6.23 |
| 44709.635416666664 | 6.29 |
| 44709.645833333336 | 6.48 |
| 44709.65625 | 6.67 |
| 44709.666666666664 | 6.81 |
| 44709.677083333336 | 6.9 |
| 44709.6875 | 7.04 |
| 44709.697916666664 | 7.19 |
| 44709.708333333336 | 7.36 |
| 44709.71875 | 7.5 |
| 44709.729166666664 | 7.72 |
| 44709.739583333336 | 7.91 |
| 44709.75 | 7.98 |
| 44709.760416666664 | 8.04 |
| 44709.770833333336 | 8 |
| 44709.78125 | 7.45 |
| 44709.791666666664 | 7.37 |
| 44709.802083333336 | 7.24 |
| 44709.8125 | 6.98 |
| 44709.822916666664 | 6.7 |
| 44709.833333333336 | 6.59 |
| 44709.84375 | 6.52 |
| 44709.854166666664 | 6.42 |
| 44709.864583333336 | 6.3 |
| 44709.875 | 6.19 |
| 44709.885416666664 | 6.13 |
| 44709.895833333336 | 6.08 |
| 44709.90625 | 6.03 |
| 44709.916666666664 | 6 |
| 44709.927083333336 | 6.05 |
| 44709.9375 | 6.12 |
| 44709.947916666664 | 6.17 |
| 44709.958333333336 | 6.19 |
| 44709.96875 | 6.23 |
| 44709.979166666664 | 6.24 |
| 44709.989583333336 | 6.25 |
| 44710.0 | 6.25 |
| 44710.010416666664 | 6.22 |
| 44710.020833333336 | 6.18 |
| 44710.03125 | 6.16 |
| 44710.041666666664 | 6.06 |
| 44710.052083333336 | 5.94 |
| 44710.0625 | 5.99 |
| 44710.072916666664 | 5.97 |
| 44710.083333333336 | 5.84 |
| 44710.09375 | 5.87 |
| 44710.104166666664 | 5.79 |
| 44710.114583333336 | 5.82 |
| 44710.125 | 5.57 |
| 44710.135416666664 | 5.42 |
| 44710.145833333336 | 5.09 |
| 44710.15625 | 4.82 |
| 44710.166666666664 | 4.92 |
| 44710.177083333336 | 5.36 |
| 44710.1875 | 5.68 |
| 44710.197916666664 | 5.84 |
| 44710.208333333336 | 6.05 |
| 44710.21875 | 6.14 |
| 44710.229166666664 | 6.22 |
| 44710.239583333336 | 6.24 |
| 44710.25 | 6.23 |
| 44710.260416666664 | 6.25 |
| 44710.270833333336 | 6.16 |
| 44710.28125 | 6.13 |
| 44710.291666666664 | 6.06 |
| 44710.302083333336 | 6.09 |
| 44710.3125 | 5.96 |
| 44710.322916666664 | 5.92 |
| 44710.333333333336 | 5.82 |
| 44710.34375 | 5.78 |
| 44710.354166666664 | 5.72 |
| 44710.364583333336 | 5.49 |
| 44710.375 | 5.29 |
| 44710.385416666664 | 5.18 |
| 44710.395833333336 | 5.15 |
| 44710.40625 | 5.08 |
| 44710.416666666664 | 5.01 |
| 44710.427083333336 | 4.95 |
| 44710.4375 | 4.9 |
| 44710.447916666664 | 4.87 |
| 44710.458333333336 | 4.83 |
| 44710.46875 | 4.81 |
| 44710.479166666664 | 4.83 |
| 44710.489583333336 | 4.89 |
| 44710.5 | 4.95 |
| 44710.510416666664 | 5.01 |
| 44710.520833333336 | 5.02 |
| 44710.53125 | 5.02 |
| 44710.541666666664 | 5.14 |
| 44710.552083333336 | 5.23 |
| 44710.5625 | 5.15 |
| 44710.572916666664 | 5.16 |
| 44710.583333333336 | 5.41 |
| 44710.59375 | 5.43 |
| 44710.604166666664 | 5.54 |
| 44710.614583333336 | 5.7 |
| 44710.625 | 6.1 |
| 44710.635416666664 | 6.18 |
| 44710.645833333336 | 6.35 |
| 44710.65625 | 6.36 |
| 44710.666666666664 | 6.54 |
| 44710.677083333336 | 6.81 |
| 44710.6875 | 7.03 |
| 44710.697916666664 | 7.2 |
| 44710.708333333336 | 7.55 |
| 44710.71875 | 7.78 |
| 44710.729166666664 | 7.99 |
| 44710.739583333336 | 8.29 |
| 44710.75 | 8.56 |
| 44710.760416666664 | 8.69 |
| 44710.770833333336 | 8.95 |
| 44710.78125 | 9.14 |
| 44710.791666666664 | 9.21 |
| 44710.802083333336 | 9.05 |
| 44710.8125 | 8.73 |
| 44710.822916666664 | 8.44 |
| 44710.833333333336 | 8 |
| 44710.84375 | 7.57 |
| 44710.854166666664 | 7.17 |
| 44710.864583333336 | 6.86 |
| 44710.875 | 6.58 |
| 44710.885416666664 | 6.4 |
| 44710.895833333336 | 6.18 |
| 44710.90625 | 6.01 |
| 44710.916666666664 | 5.88 |
| 44710.927083333336 | 5.78 |
| 44710.9375 | 5.73 |
| 44710.947916666664 | 5.69 |
| 44710.958333333336 | 5.66 |
| 44710.96875 | 5.67 |
| 44710.979166666664 | 5.7 |
| 44710.989583333336 | 5.71 |
| 44711.0 | 5.7 |
| 44711.010416666664 | 5.69 |
| 44711.020833333336 | 5.67 |
| 44711.03125 | 5.64 |
| 44711.041666666664 | 5.62 |
| 44711.052083333336 | 5.56 |
| 44711.0625 | 5.56 |
| 44711.072916666664 | 5.44 |
| 44711.083333333336 | 5.45 |
| 44711.09375 | 5.49 |
| 44711.104166666664 | 5.33 |
| 44711.114583333336 | 5.31 |
| 44711.125 | 5.17 |
| 44711.135416666664 | 5.09 |
| 44711.145833333336 | 4.99 |
| 44711.15625 | 4.87 |
| 44711.166666666664 | 4.7 |
| 44711.177083333336 | 4.46 |
| 44711.1875 | 4.34 |
| 44711.197916666664 | 4.34 |
| 44711.208333333336 | 4.85 |
| 44711.21875 | 5.16 |
| 44711.229166666664 | 5.36 |
| 44711.239583333336 | 5.56 |
| 44711.25 | 5.64 |
| 44711.260416666664 | 5.71 |
| 44711.270833333336 | 5.76 |
| 44711.28125 | 5.79 |
| 44711.291666666664 | 5.81 |
| 44711.302083333336 | 5.82 |
| 44711.3125 | 5.79 |
| 44711.322916666664 | 5.72 |
| 44711.333333333336 | 5.6 |
| 44711.34375 | 5.49 |
| 44711.354166666664 | 5.42 |
| 44711.364583333336 | 5.31 |
| 44711.375 | 5.23 |
| 44711.385416666664 | 5.13 |
| 44711.395833333336 | 4.92 |
| 44711.40625 | 4.77 |
| 44711.416666666664 | 4.69 |
| 44711.427083333336 | 4.63 |
| 44711.4375 | 4.59 |
| 44711.447916666664 | 4.54 |
| 44711.458333333336 | 4.49 |
| 44711.46875 | 4.43 |
| 44711.479166666664 | 4.38 |
| 44711.489583333336 | 4.34 |
| 44711.5 | 4.32 |
| 44711.510416666664 | 4.35 |
| 44711.520833333336 | 4.36 |
| 44711.53125 | 4.4 |
| 44711.541666666664 | 4.42 |
| 44711.552083333336 | 4.44 |
| 44711.5625 | 4.49 |
| 44711.572916666664 | 4.5 |
| 44711.583333333336 | 4.5 |
| 44711.59375 | 4.57 |
| 44711.604166666664 | 4.92 |
| 44711.614583333336 | 5.28 |
| 44711.625 | 5.64 |
| 44711.635416666664 | 5.83 |
| 44711.645833333336 | 6.17 |
| 44711.65625 | 6.49 |
| 44711.666666666664 | 6.46 |
| 44711.677083333336 | 6.46 |
| 44711.6875 | 6.45 |
| 44711.697916666664 | 6.48 |
| 44711.708333333336 | 6.86 |
| 44711.71875 | 7.27 |
| 44711.729166666664 | 7.49 |
| 44711.739583333336 | 7.82 |
| 44711.75 | 8.04 |
| 44711.760416666664 | 8.33 |
| 44711.770833333336 | 8.66 |
| 44711.78125 | 8.89 |
| 44711.791666666664 | 9.15 |
| 44711.802083333336 | 9.39 |
| 44711.8125 | 9.63 |
| 44711.822916666664 | 9.25 |
| 44711.833333333336 | 9 |
| 44711.84375 | 8.91 |
| 44711.854166666664 | 8.39 |
| 44711.864583333336 | 7.91 |
| 44711.875 | 7.41 |
| 44711.885416666664 | 6.93 |
| 44711.895833333336 | 6.48 |
| 44711.90625 | 6.26 |
| 44711.916666666664 | 6.06 |
| 44711.927083333336 | 5.98 |
| 44711.9375 | 5.89 |
| 44711.947916666664 | 5.83 |
| 44711.958333333336 | 5.78 |
| 44711.96875 | 5.77 |
| 44711.979166666664 | 5.77 |
| 44711.989583333336 | 5.78 |
| 44712.0 | 5.76 |
| 44712.010416666664 | 5.76 |
| 44712.020833333336 | 5.75 |
| 44712.03125 | 5.73 |
| 44712.041666666664 | 5.72 |
| 44712.052083333336 | 5.7 |
| 44712.0625 | 5.65 |
| 44712.072916666664 | 5.61 |
| 44712.083333333336 | 5.57 |
| 44712.09375 | 5.47 |
| 44712.104166666664 | 5.48 |
| 44712.114583333336 | 5.48 |
| 44712.125 | 5.45 |
| 44712.135416666664 | 5.38 |
| 44712.145833333336 | 5.29 |
| 44712.15625 | 5.17 |
| 44712.166666666664 | 5.15 |
| 44712.177083333336 | 4.78 |
| 44712.1875 | 4.62 |
| 44712.197916666664 | 4.63 |
| 44712.208333333336 | 4.77 |
| 44712.21875 | 4.76 |
| 44712.229166666664 | 5.15 |
| 44712.239583333336 | 5.18 |
| 44712.25 | 5.29 |
| 44712.260416666664 | 5.41 |
| 44712.270833333336 | 5.5 |
| 44712.28125 | 5.52 |
| 44712.291666666664 | 5.53 |
| 44712.302083333336 | 5.52 |
| 44712.3125 | 5.56 |
| 44712.322916666664 | 5.51 |
| 44712.333333333336 | 5.48 |
| 44712.34375 | 5.46 |
| 44712.354166666664 | 5.35 |
| 44712.364583333336 | 5.24 |
| 44712.375 | 5.15 |
| 44712.385416666664 | 5.07 |
| 44712.395833333336 | 4.99 |
| 44712.40625 | 4.92 |
| 44712.416666666664 | 4.84 |
| 44712.427083333336 | 4.7 |
| 44712.4375 | 4.62 |
| 44712.447916666664 | 4.56 |
| 44712.458333333336 | 4.51 |
| 44712.46875 | 4.47 |
| 44712.479166666664 | 4.43 |
| 44712.489583333336 | 4.4 |
| 44712.5 | 4.37 |
| 44712.510416666664 | 4.35 |
| 44712.520833333336 | 4.33 |
| 44712.53125 | 4.34 |
| 44712.541666666664 | 4.36 |
| 44712.552083333336 | 4.4 |
| 44712.5625 | 4.42 |
| 44712.572916666664 | 4.5 |
| 44712.583333333336 | 4.47 |
| 44712.59375 | 4.41 |
| 44712.604166666664 | 4.65 |
| 44712.614583333336 | 4.72 |
| 44712.625 | 4.81 |
| 44712.635416666664 | 4.92 |
| 44712.645833333336 | 5.48 |
| 44712.65625 | 5.57 |
| 44712.666666666664 | 5.81 |
| 44712.677083333336 | 5.88 |
| 44712.6875 | 5.96 |
| 44712.697916666664 | 5.89 |
| 44712.708333333336 | 6.11 |
| 44712.71875 | 6.42 |
| 44712.729166666664 | 7.29 |
| 44712.739583333336 | 7.97 |
| 44712.75 | 8.38 |
| 44712.760416666664 | 8.92 |
| 44712.770833333336 | 9.28 |
| 44712.78125 | 9.74 |
| 44712.791666666664 | 10.08 |
| 44712.802083333336 | 10.33 |
| 44712.8125 | 10.58 |
| 44712.822916666664 | 10.2 |
| 44712.833333333336 | 10.61 |
| 44712.84375 | 11.11 |
| 44712.854166666664 | 10.04 |
| 44712.864583333336 | 9.39 |
| 44712.875 | 9.24 |
| 44712.885416666664 | 9.08 |
| 44712.895833333336 | 9.05 |
| 44712.90625 | 8.94 |
| 44712.916666666664 | 8.16 |
| 44712.927083333336 | 7.24 |
| 44712.9375 | 6.8 |
| 44712.947916666664 | 6.57 |
| 44712.958333333336 | 6.12 |
| 44712.96875 | 5.86 |
| 44712.979166666664 | 5.62 |
| 44712.989583333336 | 5.42 |
| 44713.0 | 5.31 |
| 44713.010416666664 | 5.29 |
| 44713.020833333336 | 5.31 |
| 44713.03125 | 5.34 |
| 44713.041666666664 | 5.4 |
| 44713.052083333336 | 5.46 |
| 44713.0625 | 5.48 |
| 44713.072916666664 | 5.45 |
| 44713.083333333336 | 5.45 |
| 44713.09375 | 5.43 |
| 44713.104166666664 | 5.42 |
| 44713.114583333336 | 5.08 |
| 44713.125 | 5.24 |
| 44713.135416666664 | 5.34 |
| 44713.145833333336 | 5.25 |
| 44713.15625 | 5.13 |